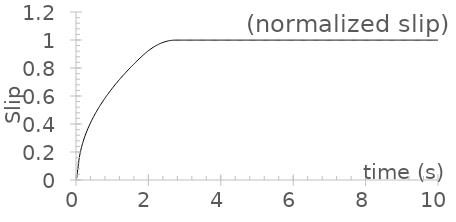
| Category | displacement |
|---|---|
| 0.0 | 0 |
| 0.01 | 0.004 |
| 0.02 | 0.015 |
| 0.03 | 0.032 |
| 0.04 | 0.053 |
| 0.05 | 0.076 |
| 0.06 | 0.099 |
| 0.07 | 0.121 |
| 0.08 | 0.141 |
| 0.09 | 0.158 |
| 0.1 | 0.172 |
| 0.11 | 0.186 |
| 0.12 | 0.198 |
| 0.13 | 0.21 |
| 0.14 | 0.221 |
| 0.15 | 0.231 |
| 0.16 | 0.241 |
| 0.17 | 0.251 |
| 0.18 | 0.26 |
| 0.19 | 0.268 |
| 0.2 | 0.277 |
| 0.21 | 0.285 |
| 0.22 | 0.293 |
| 0.23 | 0.3 |
| 0.24 | 0.308 |
| 0.25 | 0.315 |
| 0.26 | 0.322 |
| 0.27 | 0.329 |
| 0.28 | 0.336 |
| 0.29 | 0.343 |
| 0.3 | 0.349 |
| 0.31 | 0.355 |
| 0.32 | 0.362 |
| 0.33 | 0.368 |
| 0.34 | 0.374 |
| 0.35 | 0.38 |
| 0.36 | 0.386 |
| 0.37 | 0.391 |
| 0.38 | 0.397 |
| 0.39 | 0.402 |
| 0.4 | 0.408 |
| 0.41 | 0.413 |
| 0.42 | 0.419 |
| 0.43 | 0.424 |
| 0.44 | 0.429 |
| 0.45 | 0.434 |
| 0.46 | 0.439 |
| 0.47 | 0.444 |
| 0.48 | 0.449 |
| 0.49 | 0.454 |
| 0.5 | 0.459 |
| 0.51 | 0.464 |
| 0.52 | 0.468 |
| 0.53 | 0.473 |
| 0.54 | 0.478 |
| 0.55 | 0.482 |
| 0.56 | 0.487 |
| 0.57 | 0.491 |
| 0.58 | 0.496 |
| 0.59 | 0.5 |
| 0.6 | 0.504 |
| 0.61 | 0.509 |
| 0.62 | 0.513 |
| 0.63 | 0.517 |
| 0.64 | 0.521 |
| 0.65 | 0.526 |
| 0.66 | 0.53 |
| 0.67 | 0.534 |
| 0.68 | 0.538 |
| 0.69 | 0.542 |
| 0.7 | 0.546 |
| 0.71 | 0.55 |
| 0.72 | 0.554 |
| 0.73 | 0.558 |
| 0.74 | 0.562 |
| 0.75 | 0.566 |
| 0.76 | 0.569 |
| 0.77 | 0.573 |
| 0.78 | 0.577 |
| 0.79 | 0.581 |
| 0.8 | 0.584 |
| 0.81 | 0.588 |
| 0.82 | 0.592 |
| 0.83 | 0.596 |
| 0.84 | 0.599 |
| 0.85 | 0.603 |
| 0.86 | 0.606 |
| 0.87 | 0.61 |
| 0.88 | 0.613 |
| 0.89 | 0.617 |
| 0.9 | 0.62 |
| 0.91 | 0.624 |
| 0.92 | 0.627 |
| 0.93 | 0.631 |
| 0.94 | 0.634 |
| 0.95 | 0.638 |
| 0.96 | 0.641 |
| 0.97 | 0.644 |
| 0.98 | 0.648 |
| 0.99 | 0.651 |
| 1.0 | 0.654 |
| 1.01 | 0.658 |
| 1.02 | 0.661 |
| 1.03 | 0.664 |
| 1.04 | 0.668 |
| 1.05 | 0.671 |
| 1.06 | 0.674 |
| 1.07 | 0.677 |
| 1.08 | 0.68 |
| 1.09 | 0.684 |
| 1.1 | 0.687 |
| 1.11 | 0.69 |
| 1.12 | 0.693 |
| 1.13 | 0.696 |
| 1.14 | 0.699 |
| 1.15 | 0.702 |
| 1.16 | 0.705 |
| 1.17 | 0.708 |
| 1.18 | 0.711 |
| 1.19 | 0.714 |
| 1.2 | 0.717 |
| 1.21 | 0.72 |
| 1.22 | 0.723 |
| 1.23 | 0.726 |
| 1.24 | 0.729 |
| 1.25 | 0.732 |
| 1.26 | 0.735 |
| 1.27 | 0.738 |
| 1.28 | 0.741 |
| 1.29 | 0.744 |
| 1.3 | 0.747 |
| 1.31 | 0.75 |
| 1.32 | 0.753 |
| 1.33 | 0.755 |
| 1.34 | 0.758 |
| 1.35 | 0.761 |
| 1.36 | 0.764 |
| 1.37 | 0.767 |
| 1.38 | 0.769 |
| 1.39 | 0.772 |
| 1.4 | 0.775 |
| 1.41 | 0.778 |
| 1.42 | 0.781 |
| 1.43 | 0.783 |
| 1.44 | 0.786 |
| 1.45 | 0.789 |
| 1.46 | 0.791 |
| 1.47 | 0.794 |
| 1.48 | 0.797 |
| 1.49 | 0.8 |
| 1.5 | 0.802 |
| 1.51 | 0.805 |
| 1.52 | 0.808 |
| 1.53 | 0.81 |
| 1.54 | 0.813 |
| 1.55 | 0.816 |
| 1.56 | 0.818 |
| 1.57 | 0.821 |
| 1.58 | 0.823 |
| 1.59 | 0.826 |
| 1.6 | 0.829 |
| 1.61 | 0.831 |
| 1.62 | 0.834 |
| 1.63 | 0.836 |
| 1.64 | 0.839 |
| 1.65 | 0.841 |
| 1.66 | 0.844 |
| 1.67 | 0.846 |
| 1.68 | 0.849 |
| 1.69 | 0.852 |
| 1.7 | 0.854 |
| 1.71 | 0.857 |
| 1.72 | 0.859 |
| 1.73 | 0.862 |
| 1.74 | 0.864 |
| 1.75 | 0.866 |
| 1.76 | 0.869 |
| 1.77 | 0.871 |
| 1.78 | 0.874 |
| 1.79 | 0.876 |
| 1.8 | 0.879 |
| 1.81 | 0.881 |
| 1.82 | 0.884 |
| 1.83 | 0.886 |
| 1.84 | 0.888 |
| 1.85 | 0.891 |
| 1.86 | 0.893 |
| 1.87 | 0.896 |
| 1.88 | 0.898 |
| 1.89 | 0.9 |
| 1.9 | 0.902 |
| 1.91 | 0.905 |
| 1.92 | 0.907 |
| 1.93 | 0.909 |
| 1.94 | 0.911 |
| 1.95 | 0.913 |
| 1.96 | 0.915 |
| 1.97 | 0.918 |
| 1.98 | 0.92 |
| 1.99 | 0.922 |
| 2.0 | 0.924 |
| 2.01 | 0.926 |
| 2.02 | 0.928 |
| 2.03 | 0.929 |
| 2.04 | 0.931 |
| 2.05 | 0.933 |
| 2.06 | 0.935 |
| 2.07 | 0.937 |
| 2.08 | 0.939 |
| 2.09 | 0.94 |
| 2.1 | 0.942 |
| 2.11 | 0.944 |
| 2.12 | 0.946 |
| 2.13 | 0.947 |
| 2.14 | 0.949 |
| 2.15 | 0.951 |
| 2.16 | 0.952 |
| 2.17 | 0.954 |
| 2.18 | 0.955 |
| 2.19 | 0.957 |
| 2.2 | 0.958 |
| 2.21 | 0.96 |
| 2.22 | 0.961 |
| 2.23 | 0.962 |
| 2.24 | 0.964 |
| 2.25 | 0.965 |
| 2.26 | 0.966 |
| 2.27 | 0.968 |
| 2.28 | 0.969 |
| 2.29 | 0.97 |
| 2.3 | 0.972 |
| 2.31 | 0.973 |
| 2.32 | 0.974 |
| 2.33 | 0.975 |
| 2.34 | 0.976 |
| 2.35 | 0.977 |
| 2.36 | 0.978 |
| 2.37 | 0.979 |
| 2.38 | 0.98 |
| 2.39 | 0.981 |
| 2.4 | 0.982 |
| 2.41 | 0.983 |
| 2.42 | 0.984 |
| 2.43 | 0.985 |
| 2.44 | 0.986 |
| 2.45 | 0.987 |
| 2.46 | 0.987 |
| 2.47 | 0.988 |
| 2.48 | 0.989 |
| 2.49 | 0.99 |
| 2.5 | 0.99 |
| 2.51 | 0.991 |
| 2.52 | 0.992 |
| 2.53 | 0.992 |
| 2.54 | 0.993 |
| 2.55 | 0.993 |
| 2.56 | 0.994 |
| 2.57 | 0.994 |
| 2.58 | 0.995 |
| 2.59 | 0.995 |
| 2.6 | 0.996 |
| 2.61 | 0.996 |
| 2.62 | 0.997 |
| 2.63 | 0.997 |
| 2.64 | 0.997 |
| 2.65 | 0.998 |
| 2.66 | 0.998 |
| 2.67 | 0.998 |
| 2.68 | 0.998 |
| 2.69 | 0.999 |
| 2.7 | 0.999 |
| 2.71 | 0.999 |
| 2.72 | 0.999 |
| 2.73 | 0.999 |
| 2.74 | 0.999 |
| 2.75 | 0.999 |
| 2.76 | 0.999 |
| 2.77 | 0.999 |
| 2.78 | 0.999 |
| 2.79 | 0.999 |
| 2.8 | 0.999 |
| 2.81 | 0.999 |
| 2.82 | 0.999 |
| 2.83 | 0.999 |
| 2.84 | 0.999 |
| 2.85 | 0.999 |
| 2.86 | 0.999 |
| 2.87 | 0.999 |
| 2.88 | 0.999 |
| 2.89 | 0.999 |
| 2.9 | 0.999 |
| 2.91 | 0.999 |
| 2.92 | 0.999 |
| 2.93 | 0.999 |
| 2.94 | 0.999 |
| 2.95 | 0.999 |
| 2.96 | 0.999 |
| 2.97 | 0.999 |
| 2.98 | 0.999 |
| 2.99 | 0.999 |
| 3.0 | 0.999 |
| 3.01 | 0.999 |
| 3.02 | 0.999 |
| 3.03 | 0.999 |
| 3.04 | 0.999 |
| 3.05 | 0.999 |
| 3.06 | 0.999 |
| 3.07 | 0.999 |
| 3.08 | 0.999 |
| 3.09 | 0.999 |
| 3.1 | 0.999 |
| 3.11 | 0.999 |
| 3.12 | 0.999 |
| 3.13 | 0.999 |
| 3.14 | 0.999 |
| 3.15 | 0.999 |
| 3.16 | 0.999 |
| 3.17 | 0.999 |
| 3.18 | 0.999 |
| 3.19 | 0.999 |
| 3.2 | 0.999 |
| 3.21 | 0.999 |
| 3.22 | 0.999 |
| 3.23 | 0.999 |
| 3.24 | 0.999 |
| 3.25 | 0.999 |
| 3.26 | 0.999 |
| 3.27 | 0.999 |
| 3.28 | 0.999 |
| 3.29 | 0.999 |
| 3.3 | 0.999 |
| 3.31 | 0.999 |
| 3.32 | 0.999 |
| 3.33 | 0.999 |
| 3.34 | 0.999 |
| 3.35 | 0.999 |
| 3.36 | 0.999 |
| 3.37 | 0.999 |
| 3.38 | 0.999 |
| 3.39 | 0.999 |
| 3.4 | 0.999 |
| 3.41 | 0.999 |
| 3.42 | 0.999 |
| 3.43 | 0.999 |
| 3.44 | 0.999 |
| 3.45 | 0.999 |
| 3.46 | 0.999 |
| 3.47 | 0.999 |
| 3.48 | 0.999 |
| 3.49 | 0.999 |
| 3.5 | 0.999 |
| 3.51 | 0.999 |
| 3.52 | 0.999 |
| 3.53 | 0.999 |
| 3.54 | 0.999 |
| 3.55 | 0.999 |
| 3.56 | 0.999 |
| 3.57 | 0.999 |
| 3.58 | 0.999 |
| 3.59 | 0.999 |
| 3.6 | 0.999 |
| 3.61 | 0.999 |
| 3.62 | 0.999 |
| 3.63 | 0.999 |
| 3.64 | 0.999 |
| 3.65 | 0.999 |
| 3.66 | 0.999 |
| 3.67 | 0.999 |
| 3.68 | 0.999 |
| 3.69 | 0.999 |
| 3.7 | 0.999 |
| 3.71 | 0.999 |
| 3.72 | 0.999 |
| 3.73 | 0.999 |
| 3.74 | 0.999 |
| 3.75 | 0.999 |
| 3.76 | 0.999 |
| 3.77 | 0.999 |
| 3.78 | 0.999 |
| 3.79 | 0.999 |
| 3.8 | 0.999 |
| 3.81 | 0.999 |
| 3.82 | 0.999 |
| 3.83 | 0.999 |
| 3.84 | 0.999 |
| 3.85 | 0.999 |
| 3.86 | 0.999 |
| 3.87 | 0.999 |
| 3.88 | 0.999 |
| 3.89 | 0.999 |
| 3.9 | 0.999 |
| 3.91 | 0.999 |
| 3.92 | 0.999 |
| 3.93 | 0.999 |
| 3.94 | 0.999 |
| 3.95 | 0.999 |
| 3.96 | 0.999 |
| 3.97 | 0.999 |
| 3.98 | 0.999 |
| 3.99 | 0.999 |
| 4.0 | 0.999 |
| 4.01 | 0.999 |
| 4.02 | 0.999 |
| 4.03 | 0.999 |
| 4.04 | 0.999 |
| 4.05 | 0.999 |
| 4.06 | 0.999 |
| 4.07 | 0.999 |
| 4.08 | 0.999 |
| 4.09 | 0.999 |
| 4.1 | 0.999 |
| 4.11 | 0.999 |
| 4.12 | 0.999 |
| 4.13 | 0.999 |
| 4.14 | 0.999 |
| 4.15 | 0.999 |
| 4.16 | 0.999 |
| 4.17 | 0.999 |
| 4.18 | 0.999 |
| 4.19 | 0.999 |
| 4.2 | 0.999 |
| 4.21 | 0.999 |
| 4.22 | 0.999 |
| 4.23 | 0.999 |
| 4.24 | 0.999 |
| 4.25 | 0.999 |
| 4.26 | 0.999 |
| 4.27 | 0.999 |
| 4.28 | 0.999 |
| 4.29 | 0.999 |
| 4.3 | 0.999 |
| 4.31 | 0.999 |
| 4.32 | 0.999 |
| 4.33 | 0.999 |
| 4.34 | 0.999 |
| 4.35 | 0.999 |
| 4.36 | 0.999 |
| 4.37 | 0.999 |
| 4.38 | 0.999 |
| 4.39 | 0.999 |
| 4.4 | 0.999 |
| 4.41 | 0.999 |
| 4.42 | 0.999 |
| 4.43 | 0.999 |
| 4.44 | 0.999 |
| 4.45 | 0.999 |
| 4.46 | 0.999 |
| 4.47 | 0.999 |
| 4.48 | 0.999 |
| 4.49 | 0.999 |
| 4.5 | 0.999 |
| 4.51 | 0.999 |
| 4.52 | 0.999 |
| 4.53 | 0.999 |
| 4.54 | 0.999 |
| 4.55 | 0.999 |
| 4.56 | 0.999 |
| 4.57 | 0.999 |
| 4.58 | 0.999 |
| 4.59 | 0.999 |
| 4.6 | 0.999 |
| 4.61 | 0.999 |
| 4.62 | 0.999 |
| 4.63 | 0.999 |
| 4.64 | 0.999 |
| 4.65 | 0.999 |
| 4.66 | 0.999 |
| 4.67 | 0.999 |
| 4.68 | 0.999 |
| 4.69 | 0.999 |
| 4.7 | 0.999 |
| 4.71 | 0.999 |
| 4.72 | 0.999 |
| 4.73 | 0.999 |
| 4.74 | 0.999 |
| 4.75 | 0.999 |
| 4.76 | 0.999 |
| 4.77 | 0.999 |
| 4.78 | 0.999 |
| 4.79 | 0.999 |
| 4.8 | 0.999 |
| 4.81 | 0.999 |
| 4.82 | 0.999 |
| 4.83 | 0.999 |
| 4.84 | 0.999 |
| 4.85 | 0.999 |
| 4.86 | 0.999 |
| 4.87 | 0.999 |
| 4.88 | 0.999 |
| 4.89 | 0.999 |
| 4.9 | 0.999 |
| 4.91 | 0.999 |
| 4.92 | 0.999 |
| 4.93 | 0.999 |
| 4.94 | 0.999 |
| 4.95 | 0.999 |
| 4.96 | 0.999 |
| 4.97 | 0.999 |
| 4.98 | 0.999 |
| 4.99 | 0.999 |
| 5.0 | 0.999 |
| 5.01 | 0.999 |
| 5.02 | 0.999 |
| 5.03 | 0.999 |
| 5.04 | 0.999 |
| 5.05 | 0.999 |
| 5.06 | 0.999 |
| 5.07 | 0.999 |
| 5.08 | 0.999 |
| 5.09 | 0.999 |
| 5.1 | 0.999 |
| 5.11 | 0.999 |
| 5.12 | 0.999 |
| 5.13 | 0.999 |
| 5.14 | 0.999 |
| 5.15 | 0.999 |
| 5.16 | 0.999 |
| 5.17 | 0.999 |
| 5.18 | 0.999 |
| 5.19 | 0.999 |
| 5.2 | 0.999 |
| 5.21 | 0.999 |
| 5.22 | 0.999 |
| 5.23 | 0.999 |
| 5.24 | 0.999 |
| 5.25 | 0.999 |
| 5.26 | 0.999 |
| 5.27 | 0.999 |
| 5.28 | 0.999 |
| 5.29 | 0.999 |
| 5.3 | 0.999 |
| 5.31 | 0.999 |
| 5.32 | 0.999 |
| 5.33 | 0.999 |
| 5.34 | 0.999 |
| 5.35 | 0.999 |
| 5.36 | 0.999 |
| 5.37 | 0.999 |
| 5.38 | 0.999 |
| 5.39 | 0.999 |
| 5.4 | 0.999 |
| 5.41 | 0.999 |
| 5.42 | 0.999 |
| 5.43 | 0.999 |
| 5.44 | 0.999 |
| 5.45 | 0.999 |
| 5.46 | 0.999 |
| 5.47 | 0.999 |
| 5.48 | 0.999 |
| 5.49 | 0.999 |
| 5.5 | 0.999 |
| 5.51 | 0.999 |
| 5.52 | 0.999 |
| 5.53 | 0.999 |
| 5.54 | 0.999 |
| 5.55 | 0.999 |
| 5.56 | 0.999 |
| 5.57 | 0.999 |
| 5.58 | 0.999 |
| 5.59 | 0.999 |
| 5.6 | 0.999 |
| 5.61 | 0.999 |
| 5.62 | 0.999 |
| 5.63 | 0.999 |
| 5.64 | 0.999 |
| 5.65 | 0.999 |
| 5.66 | 0.999 |
| 5.67 | 0.999 |
| 5.68 | 0.999 |
| 5.69 | 0.999 |
| 5.7 | 0.999 |
| 5.71 | 0.999 |
| 5.72 | 0.999 |
| 5.73 | 0.999 |
| 5.74 | 0.999 |
| 5.75 | 0.999 |
| 5.76 | 0.999 |
| 5.77 | 0.999 |
| 5.78 | 0.999 |
| 5.79 | 0.999 |
| 5.8 | 0.999 |
| 5.81 | 0.999 |
| 5.82 | 0.999 |
| 5.83 | 0.999 |
| 5.84 | 0.999 |
| 5.85 | 0.999 |
| 5.86 | 0.999 |
| 5.87 | 0.999 |
| 5.88 | 0.999 |
| 5.89 | 0.999 |
| 5.9 | 0.999 |
| 5.91 | 0.999 |
| 5.92 | 0.999 |
| 5.93 | 0.999 |
| 5.94 | 0.999 |
| 5.95 | 0.999 |
| 5.96 | 0.999 |
| 5.97 | 0.999 |
| 5.98 | 0.999 |
| 5.99 | 0.999 |
| 6.0 | 0.999 |
| 6.01 | 0.999 |
| 6.02 | 0.999 |
| 6.03 | 0.999 |
| 6.04 | 0.999 |
| 6.05 | 0.999 |
| 6.06 | 0.999 |
| 6.07 | 0.999 |
| 6.08 | 0.999 |
| 6.09 | 0.999 |
| 6.1 | 0.999 |
| 6.11 | 0.999 |
| 6.12 | 0.999 |
| 6.13 | 0.999 |
| 6.14 | 0.999 |
| 6.15 | 0.999 |
| 6.16 | 0.999 |
| 6.17 | 0.999 |
| 6.18 | 0.999 |
| 6.19 | 0.999 |
| 6.2 | 0.999 |
| 6.21 | 0.999 |
| 6.22 | 0.999 |
| 6.23 | 0.999 |
| 6.24 | 0.999 |
| 6.25 | 0.999 |
| 6.26 | 0.999 |
| 6.27 | 0.999 |
| 6.28 | 0.999 |
| 6.29 | 0.999 |
| 6.3 | 0.999 |
| 6.31 | 0.999 |
| 6.32 | 0.999 |
| 6.33 | 0.999 |
| 6.34 | 0.999 |
| 6.35 | 0.999 |
| 6.36 | 0.999 |
| 6.37 | 0.999 |
| 6.38 | 0.999 |
| 6.39 | 0.999 |
| 6.4 | 0.999 |
| 6.41 | 0.999 |
| 6.42 | 0.999 |
| 6.43 | 0.999 |
| 6.44 | 0.999 |
| 6.45 | 0.999 |
| 6.46 | 0.999 |
| 6.47 | 0.999 |
| 6.48 | 0.999 |
| 6.49 | 0.999 |
| 6.5 | 0.999 |
| 6.51 | 0.999 |
| 6.52 | 0.999 |
| 6.53 | 0.999 |
| 6.54 | 0.999 |
| 6.55 | 0.999 |
| 6.56 | 0.999 |
| 6.57 | 0.999 |
| 6.58 | 0.999 |
| 6.59 | 0.999 |
| 6.6 | 0.999 |
| 6.61 | 0.999 |
| 6.62 | 0.999 |
| 6.63 | 0.999 |
| 6.64 | 0.999 |
| 6.65 | 0.999 |
| 6.66 | 0.999 |
| 6.67 | 0.999 |
| 6.68 | 0.999 |
| 6.69 | 0.999 |
| 6.7 | 0.999 |
| 6.71 | 0.999 |
| 6.72 | 0.999 |
| 6.73 | 0.999 |
| 6.74 | 0.999 |
| 6.75 | 0.999 |
| 6.76 | 0.999 |
| 6.77 | 0.999 |
| 6.78 | 0.999 |
| 6.79 | 0.999 |
| 6.8 | 0.999 |
| 6.81 | 0.999 |
| 6.82 | 0.999 |
| 6.83 | 0.999 |
| 6.84 | 0.999 |
| 6.85 | 0.999 |
| 6.86 | 0.999 |
| 6.87 | 0.999 |
| 6.88 | 0.999 |
| 6.89 | 0.999 |
| 6.9 | 0.999 |
| 6.91 | 0.999 |
| 6.92 | 0.999 |
| 6.93 | 0.999 |
| 6.94 | 0.999 |
| 6.95 | 0.999 |
| 6.96 | 0.999 |
| 6.97 | 0.999 |
| 6.98 | 0.999 |
| 6.99 | 0.999 |
| 7.0 | 0.999 |
| 7.01 | 0.999 |
| 7.02 | 0.999 |
| 7.03 | 0.999 |
| 7.04 | 0.999 |
| 7.05 | 0.999 |
| 7.06 | 0.999 |
| 7.07 | 0.999 |
| 7.08 | 0.999 |
| 7.09 | 0.999 |
| 7.1 | 0.999 |
| 7.11 | 0.999 |
| 7.12 | 0.999 |
| 7.13 | 0.999 |
| 7.14 | 0.999 |
| 7.15 | 0.999 |
| 7.16 | 0.999 |
| 7.17 | 0.999 |
| 7.18 | 0.999 |
| 7.19 | 0.999 |
| 7.2 | 0.999 |
| 7.21 | 0.999 |
| 7.22 | 0.999 |
| 7.23 | 0.999 |
| 7.24 | 0.999 |
| 7.25 | 0.999 |
| 7.26 | 0.999 |
| 7.27 | 0.999 |
| 7.28 | 0.999 |
| 7.29 | 0.999 |
| 7.3 | 0.999 |
| 7.31 | 0.999 |
| 7.32 | 0.999 |
| 7.33 | 0.999 |
| 7.34 | 0.999 |
| 7.35 | 0.999 |
| 7.36 | 0.999 |
| 7.37 | 0.999 |
| 7.38 | 0.999 |
| 7.39 | 0.999 |
| 7.4 | 0.999 |
| 7.41 | 0.999 |
| 7.42 | 0.999 |
| 7.43 | 0.999 |
| 7.44 | 0.999 |
| 7.45 | 0.999 |
| 7.46 | 0.999 |
| 7.47 | 0.999 |
| 7.48 | 0.999 |
| 7.49 | 0.999 |
| 7.5 | 0.999 |
| 7.51 | 0.999 |
| 7.52 | 0.999 |
| 7.53 | 0.999 |
| 7.54 | 0.999 |
| 7.55 | 0.999 |
| 7.56 | 0.999 |
| 7.57 | 0.999 |
| 7.58 | 0.999 |
| 7.59 | 0.999 |
| 7.6 | 0.999 |
| 7.61 | 0.999 |
| 7.62 | 0.999 |
| 7.63 | 0.999 |
| 7.64 | 0.999 |
| 7.65 | 0.999 |
| 7.66 | 0.999 |
| 7.67 | 0.999 |
| 7.68 | 0.999 |
| 7.69 | 0.999 |
| 7.7 | 0.999 |
| 7.71 | 0.999 |
| 7.72 | 0.999 |
| 7.73 | 0.999 |
| 7.74 | 0.999 |
| 7.75 | 0.999 |
| 7.76 | 0.999 |
| 7.77 | 0.999 |
| 7.78 | 0.999 |
| 7.79 | 0.999 |
| 7.8 | 0.999 |
| 7.81 | 0.999 |
| 7.82 | 0.999 |
| 7.83 | 0.999 |
| 7.84 | 0.999 |
| 7.85 | 0.999 |
| 7.86 | 0.999 |
| 7.87 | 0.999 |
| 7.88 | 0.999 |
| 7.89 | 0.999 |
| 7.9 | 0.999 |
| 7.91 | 0.999 |
| 7.92 | 0.999 |
| 7.93 | 0.999 |
| 7.94 | 0.999 |
| 7.95 | 0.999 |
| 7.96 | 0.999 |
| 7.97 | 0.999 |
| 7.98 | 0.999 |
| 7.99 | 0.999 |
| 8.0 | 0.999 |
| 8.01 | 0.999 |
| 8.02 | 0.999 |
| 8.03 | 0.999 |
| 8.04 | 0.999 |
| 8.05 | 0.999 |
| 8.06 | 0.999 |
| 8.07 | 0.999 |
| 8.08 | 0.999 |
| 8.09 | 0.999 |
| 8.1 | 0.999 |
| 8.11 | 0.999 |
| 8.12 | 0.999 |
| 8.13 | 0.999 |
| 8.14 | 0.999 |
| 8.15 | 0.999 |
| 8.16 | 0.999 |
| 8.17 | 0.999 |
| 8.18 | 0.999 |
| 8.19 | 0.999 |
| 8.2 | 0.999 |
| 8.21 | 0.999 |
| 8.22 | 0.999 |
| 8.23 | 0.999 |
| 8.24 | 0.999 |
| 8.25 | 0.999 |
| 8.26 | 0.999 |
| 8.27 | 0.999 |
| 8.28 | 0.999 |
| 8.29 | 0.999 |
| 8.3 | 0.999 |
| 8.31 | 0.999 |
| 8.32 | 0.999 |
| 8.33 | 0.999 |
| 8.34 | 0.999 |
| 8.35 | 0.999 |
| 8.36 | 0.999 |
| 8.37 | 0.999 |
| 8.38 | 0.999 |
| 8.39 | 0.999 |
| 8.4 | 0.999 |
| 8.41 | 0.999 |
| 8.42 | 0.999 |
| 8.43 | 0.999 |
| 8.44 | 0.999 |
| 8.45 | 0.999 |
| 8.46 | 0.999 |
| 8.47 | 0.999 |
| 8.48 | 0.999 |
| 8.49 | 0.999 |
| 8.5 | 0.999 |
| 8.51 | 0.999 |
| 8.52 | 0.999 |
| 8.53 | 0.999 |
| 8.54 | 0.999 |
| 8.55 | 0.999 |
| 8.56 | 0.999 |
| 8.57 | 0.999 |
| 8.58 | 0.999 |
| 8.59 | 0.999 |
| 8.6 | 0.999 |
| 8.61 | 0.999 |
| 8.62 | 0.999 |
| 8.63 | 0.999 |
| 8.64 | 0.999 |
| 8.65 | 0.999 |
| 8.66 | 0.999 |
| 8.67 | 0.999 |
| 8.68 | 0.999 |
| 8.69 | 0.999 |
| 8.7 | 0.999 |
| 8.71 | 0.999 |
| 8.72 | 0.999 |
| 8.73 | 0.999 |
| 8.74 | 0.999 |
| 8.75 | 0.999 |
| 8.76 | 0.999 |
| 8.77 | 0.999 |
| 8.78 | 0.999 |
| 8.79 | 0.999 |
| 8.8 | 0.999 |
| 8.81 | 0.999 |
| 8.82 | 0.999 |
| 8.83 | 0.999 |
| 8.84 | 0.999 |
| 8.85 | 0.999 |
| 8.86 | 0.999 |
| 8.87 | 0.999 |
| 8.88 | 0.999 |
| 8.89 | 0.999 |
| 8.9 | 0.999 |
| 8.91 | 0.999 |
| 8.92 | 0.999 |
| 8.93 | 0.999 |
| 8.94 | 0.999 |
| 8.95 | 0.999 |
| 8.96 | 0.999 |
| 8.97 | 0.999 |
| 8.98 | 0.999 |
| 8.99 | 0.999 |
| 9.0 | 0.999 |
| 9.01 | 0.999 |
| 9.02 | 0.999 |
| 9.03 | 0.999 |
| 9.04 | 0.999 |
| 9.05 | 0.999 |
| 9.06 | 0.999 |
| 9.07 | 0.999 |
| 9.08 | 0.999 |
| 9.09 | 0.999 |
| 9.1 | 0.999 |
| 9.11 | 0.999 |
| 9.12 | 0.999 |
| 9.13 | 0.999 |
| 9.14 | 0.999 |
| 9.15 | 0.999 |
| 9.16 | 0.999 |
| 9.17 | 0.999 |
| 9.18 | 0.999 |
| 9.19 | 0.999 |
| 9.2 | 0.999 |
| 9.21 | 0.999 |
| 9.22 | 0.999 |
| 9.23 | 0.999 |
| 9.24 | 0.999 |
| 9.25 | 0.999 |
| 9.26 | 0.999 |
| 9.27 | 0.999 |
| 9.28 | 0.999 |
| 9.29 | 0.999 |
| 9.3 | 0.999 |
| 9.31 | 0.999 |
| 9.32 | 0.999 |
| 9.33 | 0.999 |
| 9.34 | 0.999 |
| 9.35 | 0.999 |
| 9.36 | 0.999 |
| 9.37 | 0.999 |
| 9.38 | 0.999 |
| 9.39 | 0.999 |
| 9.4 | 0.999 |
| 9.41 | 0.999 |
| 9.42 | 0.999 |
| 9.43 | 0.999 |
| 9.44 | 0.999 |
| 9.45 | 0.999 |
| 9.46 | 0.999 |
| 9.47 | 0.999 |
| 9.48 | 0.999 |
| 9.49 | 0.999 |
| 9.5 | 0.999 |
| 9.51 | 0.999 |
| 9.52 | 0.999 |
| 9.53 | 0.999 |
| 9.54 | 0.999 |
| 9.55 | 0.999 |
| 9.56 | 0.999 |
| 9.57 | 0.999 |
| 9.58 | 0.999 |
| 9.59 | 0.999 |
| 9.6 | 0.999 |
| 9.61 | 0.999 |
| 9.62 | 0.999 |
| 9.63 | 0.999 |
| 9.64 | 0.999 |
| 9.65 | 0.999 |
| 9.66 | 0.999 |
| 9.67 | 0.999 |
| 9.68 | 0.999 |
| 9.69 | 0.999 |
| 9.7 | 0.999 |
| 9.71 | 0.999 |
| 9.72 | 0.999 |
| 9.73 | 0.999 |
| 9.74 | 0.999 |
| 9.75 | 0.999 |
| 9.76 | 0.999 |
| 9.77 | 0.999 |
| 9.78 | 0.999 |
| 9.79 | 0.999 |
| 9.8 | 0.999 |
| 9.81 | 0.999 |
| 9.82 | 0.999 |
| 9.83 | 0.999 |
| 9.84 | 0.999 |
| 9.85 | 0.999 |
| 9.86 | 0.999 |
| 9.87 | 0.999 |
| 9.88 | 0.999 |
| 9.89 | 0.999 |
| 9.9 | 0.999 |
| 9.91 | 0.999 |
| 9.92 | 0.999 |
| 9.93 | 0.999 |
| 9.94 | 0.999 |
| 9.95 | 0.999 |
| 9.96 | 0.999 |
| 9.97 | 0.999 |
| 9.98 | 0.999 |
| 9.99 | 0.999 |
| 10.0 | 0.999 |
| 10.01 | 0.999 |
| 10.02 | 0.999 |
| 10.03 | 0.999 |
| 10.04 | 0.999 |
| 10.05 | 0.999 |
| 10.06 | 0.999 |
| 10.07 | 0.999 |
| 10.08 | 0.999 |
| 10.09 | 0.999 |
| 10.1 | 0.999 |
| 10.11 | 0.999 |
| 10.12 | 0.999 |
| 10.13 | 0.999 |
| 10.14 | 0.999 |
| 10.15 | 0.999 |
| 10.16 | 0.999 |
| 10.17 | 0.999 |
| 10.18 | 0.999 |
| 10.19 | 0.999 |
| 10.2 | 0.999 |
| 10.21 | 0.999 |
| 10.22 | 0.999 |
| 10.23 | 0.999 |
| 10.24 | 0.999 |
| 10.25 | 0.999 |
| 10.26 | 0.999 |
| 10.27 | 0.999 |
| 10.28 | 0.999 |
| 10.29 | 0.999 |
| 10.3 | 0.999 |
| 10.31 | 0.999 |
| 10.32 | 0.999 |
| 10.33 | 0.999 |
| 10.34 | 0.999 |
| 10.35 | 0.999 |
| 10.36 | 0.999 |
| 10.37 | 0.999 |
| 10.38 | 0.999 |
| 10.39 | 0.999 |
| 10.4 | 0.999 |
| 10.41 | 0.999 |
| 10.42 | 0.999 |
| 10.43 | 0.999 |
| 10.44 | 0.999 |
| 10.45 | 0.999 |
| 10.46 | 0.999 |
| 10.47 | 0.999 |
| 10.48 | 0.999 |
| 10.49 | 0.999 |
| 10.5 | 0.999 |
| 10.51 | 0.999 |
| 10.52 | 0.999 |
| 10.53 | 0.999 |
| 10.54 | 0.999 |
| 10.55 | 0.999 |
| 10.56 | 0.999 |
| 10.57 | 0.999 |
| 10.58 | 0.999 |
| 10.59 | 0.999 |
| 10.6 | 0.999 |
| 10.61 | 0.999 |
| 10.62 | 0.999 |
| 10.63 | 0.999 |
| 10.64 | 0.999 |
| 10.65 | 0.999 |
| 10.66 | 0.999 |
| 10.67 | 0.999 |
| 10.68 | 0.999 |
| 10.69 | 0.999 |
| 10.7 | 0.999 |
| 10.71 | 0.999 |
| 10.72 | 0.999 |
| 10.73 | 0.999 |
| 10.74 | 0.999 |
| 10.75 | 0.999 |
| 10.76 | 0.999 |
| 10.77 | 0.999 |
| 10.78 | 0.999 |
| 10.79 | 0.999 |
| 10.8 | 0.999 |
| 10.81 | 0.999 |
| 10.82 | 0.999 |
| 10.83 | 0.999 |
| 10.84 | 0.999 |
| 10.85 | 0.999 |
| 10.86 | 0.999 |
| 10.87 | 0.999 |
| 10.88 | 0.999 |
| 10.89 | 0.999 |
| 10.9 | 0.999 |
| 10.91 | 0.999 |
| 10.92 | 0.999 |
| 10.93 | 0.999 |
| 10.94 | 0.999 |
| 10.95 | 0.999 |
| 10.96 | 0.999 |
| 10.97 | 0.999 |
| 10.98 | 0.999 |
| 10.99 | 0.999 |
| 11.0 | 0.999 |
| 11.01 | 0.999 |
| 11.02 | 0.999 |
| 11.03 | 0.999 |
| 11.04 | 0.999 |
| 11.05 | 0.999 |
| 11.06 | 0.999 |
| 11.07 | 0.999 |
| 11.08 | 0.999 |
| 11.09 | 0.999 |
| 11.1 | 0.999 |
| 11.11 | 0.999 |
| 11.12 | 0.999 |
| 11.13 | 0.999 |
| 11.14 | 0.999 |
| 11.15 | 0.999 |
| 11.16 | 0.999 |
| 11.17 | 0.999 |
| 11.18 | 0.999 |
| 11.19 | 0.999 |
| 11.2 | 0.999 |
| 11.21 | 0.999 |
| 11.22 | 0.999 |
| 11.23 | 0.999 |
| 11.24 | 0.999 |
| 11.25 | 0.999 |
| 11.26 | 0.999 |
| 11.27 | 0.999 |
| 11.28 | 0.999 |
| 11.29 | 0.999 |
| 11.3 | 0.999 |
| 11.31 | 0.999 |
| 11.32 | 0.999 |
| 11.33 | 0.999 |
| 11.34 | 0.999 |
| 11.35 | 0.999 |
| 11.36 | 0.999 |
| 11.37 | 0.999 |
| 11.38 | 0.999 |
| 11.39 | 0.999 |
| 11.4 | 0.999 |
| 11.41 | 0.999 |
| 11.42 | 0.999 |
| 11.43 | 0.999 |
| 11.44 | 0.999 |
| 11.45 | 0.999 |
| 11.46 | 0.999 |
| 11.47 | 0.999 |
| 11.48 | 0.999 |
| 11.49 | 0.999 |
| 11.5 | 0.999 |
| 11.51 | 0.999 |
| 11.52 | 0.999 |
| 11.53 | 0.999 |
| 11.54 | 0.999 |
| 11.55 | 0.999 |
| 11.56 | 0.999 |
| 11.57 | 0.999 |
| 11.58 | 0.999 |
| 11.59 | 0.999 |
| 11.6 | 0.999 |
| 11.61 | 0.999 |
| 11.62 | 0.999 |
| 11.63 | 0.999 |
| 11.64 | 0.999 |
| 11.65 | 0.999 |
| 11.66 | 0.999 |
| 11.67 | 0.999 |
| 11.68 | 0.999 |
| 11.69 | 0.999 |
| 11.7 | 0.999 |
| 11.71 | 0.999 |
| 11.72 | 0.999 |
| 11.73 | 0.999 |
| 11.74 | 0.999 |
| 11.75 | 0.999 |
| 11.76 | 0.999 |
| 11.77 | 0.999 |
| 11.78 | 0.999 |
| 11.79 | 0.999 |
| 11.8 | 0.999 |
| 11.81 | 0.999 |
| 11.82 | 0.999 |
| 11.83 | 0.999 |
| 11.84 | 0.999 |
| 11.85 | 0.999 |
| 11.86 | 0.999 |
| 11.87 | 0.999 |
| 11.88 | 0.999 |
| 11.89 | 0.999 |
| 11.9 | 0.999 |
| 11.91 | 0.999 |
| 11.92 | 0.999 |
| 11.93 | 0.999 |
| 11.94 | 0.999 |
| 11.95 | 0.999 |
| 11.96 | 0.999 |
| 11.97 | 0.999 |
| 11.98 | 0.999 |
| 11.99 | 0.999 |
| 12.0 | 0.999 |
| 12.01 | 0.999 |
| 12.02 | 0.999 |
| 12.03 | 0.999 |
| 12.04 | 0.999 |
| 12.05 | 0.999 |
| 12.06 | 0.999 |
| 12.07 | 0.999 |
| 12.08 | 0.999 |
| 12.09 | 0.999 |
| 12.1 | 0.999 |
| 12.11 | 0.999 |
| 12.12 | 0.999 |
| 12.13 | 0.999 |
| 12.14 | 0.999 |
| 12.15 | 0.999 |
| 12.16 | 0.999 |
| 12.17 | 0.999 |
| 12.18 | 0.999 |
| 12.19 | 0.999 |
| 12.2 | 0.999 |
| 12.21 | 0.999 |
| 12.22 | 0.999 |
| 12.23 | 0.999 |
| 12.24 | 0.999 |
| 12.25 | 0.999 |
| 12.26 | 0.999 |
| 12.27 | 0.999 |
| 12.28 | 0.999 |
| 12.29 | 0.999 |
| 12.3 | 0.999 |
| 12.31 | 0.999 |
| 12.32 | 0.999 |
| 12.33 | 0.999 |
| 12.34 | 0.999 |
| 12.35 | 0.999 |
| 12.36 | 0.999 |
| 12.37 | 0.999 |
| 12.38 | 0.999 |
| 12.39 | 0.999 |
| 12.4 | 0.999 |
| 12.41 | 0.999 |
| 12.42 | 0.999 |
| 12.43 | 0.999 |
| 12.44 | 0.999 |
| 12.45 | 0.999 |
| 12.46 | 0.999 |
| 12.47 | 0.999 |
| 12.48 | 0.999 |
| 12.49 | 0.999 |
| 12.5 | 0.999 |
| 12.51 | 0.999 |
| 12.52 | 0.999 |
| 12.53 | 0.999 |
| 12.54 | 0.999 |
| 12.55 | 0.999 |
| 12.56 | 0.999 |
| 12.57 | 0.999 |
| 12.58 | 0.999 |
| 12.59 | 0.999 |
| 12.6 | 0.999 |
| 12.61 | 0.999 |
| 12.62 | 0.999 |
| 12.63 | 0.999 |
| 12.64 | 0.999 |
| 12.65 | 0.999 |
| 12.66 | 0.999 |
| 12.67 | 0.999 |
| 12.68 | 0.999 |
| 12.69 | 0.999 |
| 12.7 | 0.999 |
| 12.71 | 0.999 |
| 12.72 | 0.999 |
| 12.73 | 0.999 |
| 12.74 | 0.999 |
| 12.75 | 0.999 |
| 12.76 | 0.999 |
| 12.77 | 0.999 |
| 12.78 | 0.999 |
| 12.79 | 0.999 |
| 12.8 | 0.999 |
| 12.81 | 0.999 |
| 12.82 | 0.999 |
| 12.83 | 0.999 |
| 12.84 | 0.999 |
| 12.85 | 0.999 |
| 12.86 | 0.999 |
| 12.87 | 0.999 |
| 12.88 | 0.999 |
| 12.89 | 0.999 |
| 12.9 | 0.999 |
| 12.91 | 0.999 |
| 12.92 | 0.999 |
| 12.93 | 0.999 |
| 12.94 | 0.999 |
| 12.95 | 0.999 |
| 12.96 | 0.999 |
| 12.97 | 0.999 |
| 12.98 | 0.999 |
| 12.99 | 0.999 |
| 13.0 | 0.999 |
| 13.01 | 0.999 |
| 13.02 | 0.999 |
| 13.03 | 0.999 |
| 13.04 | 0.999 |
| 13.05 | 0.999 |
| 13.06 | 0.999 |
| 13.07 | 0.999 |
| 13.08 | 0.999 |
| 13.09 | 0.999 |
| 13.1 | 0.999 |
| 13.11 | 0.999 |
| 13.12 | 0.999 |
| 13.13 | 0.999 |
| 13.14 | 0.999 |
| 13.15 | 0.999 |
| 13.16 | 0.999 |
| 13.17 | 0.999 |
| 13.18 | 0.999 |
| 13.19 | 0.999 |
| 13.2 | 0.999 |
| 13.21 | 0.999 |
| 13.22 | 0.999 |
| 13.23 | 0.999 |
| 13.24 | 0.999 |
| 13.25 | 0.999 |
| 13.26 | 0.999 |
| 13.27 | 0.999 |
| 13.28 | 0.999 |
| 13.29 | 0.999 |
| 13.3 | 0.999 |
| 13.31 | 0.999 |
| 13.32 | 0.999 |
| 13.33 | 0.999 |
| 13.34 | 0.999 |
| 13.35 | 0.999 |
| 13.36 | 0.999 |
| 13.37 | 0.999 |
| 13.38 | 0.999 |
| 13.39 | 0.999 |
| 13.4 | 0.999 |
| 13.41 | 0.999 |
| 13.42 | 0.999 |
| 13.43 | 0.999 |
| 13.44 | 0.999 |
| 13.45 | 0.999 |
| 13.46 | 0.999 |
| 13.47 | 0.999 |
| 13.48 | 0.999 |
| 13.49 | 0.999 |
| 13.5 | 0.999 |
| 13.51 | 0.999 |
| 13.52 | 0.999 |
| 13.53 | 0.999 |
| 13.54 | 0.999 |
| 13.55 | 0.999 |
| 13.56 | 0.999 |
| 13.57 | 0.999 |
| 13.58 | 0.999 |
| 13.59 | 0.999 |
| 13.6 | 0.999 |
| 13.61 | 0.999 |
| 13.62 | 0.999 |
| 13.63 | 0.999 |
| 13.64 | 0.999 |
| 13.65 | 0.999 |
| 13.66 | 0.999 |
| 13.67 | 0.999 |
| 13.68 | 0.999 |
| 13.69 | 0.999 |
| 13.7 | 0.999 |
| 13.71 | 0.999 |
| 13.72 | 0.999 |
| 13.73 | 0.999 |
| 13.74 | 0.999 |
| 13.75 | 0.999 |
| 13.76 | 0.999 |
| 13.77 | 0.999 |
| 13.78 | 0.999 |
| 13.79 | 0.999 |
| 13.8 | 0.999 |
| 13.81 | 0.999 |
| 13.82 | 0.999 |
| 13.83 | 0.999 |
| 13.84 | 0.999 |
| 13.85 | 0.999 |
| 13.86 | 0.999 |
| 13.87 | 0.999 |
| 13.88 | 0.999 |
| 13.89 | 0.999 |
| 13.9 | 0.999 |
| 13.91 | 0.999 |
| 13.92 | 0.999 |
| 13.93 | 0.999 |
| 13.94 | 0.999 |
| 13.95 | 0.999 |
| 13.96 | 0.999 |
| 13.97 | 0.999 |
| 13.98 | 0.999 |
| 13.99 | 0.999 |
| 14.0 | 0.999 |
| 14.01 | 0.999 |
| 14.02 | 0.999 |
| 14.03 | 0.999 |
| 14.04 | 0.999 |
| 14.05 | 0.999 |
| 14.06 | 0.999 |
| 14.07 | 0.999 |
| 14.08 | 0.999 |
| 14.09 | 0.999 |
| 14.1 | 0.999 |
| 14.11 | 0.999 |
| 14.12 | 0.999 |
| 14.13 | 0.999 |
| 14.14 | 0.999 |
| 14.15 | 0.999 |
| 14.16 | 0.999 |
| 14.17 | 0.999 |
| 14.18 | 0.999 |
| 14.19 | 0.999 |
| 14.2 | 0.999 |
| 14.21 | 0.999 |
| 14.22 | 0.999 |
| 14.23 | 0.999 |
| 14.24 | 0.999 |
| 14.25 | 0.999 |
| 14.26 | 0.999 |
| 14.27 | 0.999 |
| 14.28 | 0.999 |
| 14.29 | 0.999 |
| 14.3 | 0.999 |
| 14.31 | 0.999 |
| 14.32 | 0.999 |
| 14.33 | 0.999 |
| 14.34 | 0.999 |
| 14.35 | 0.999 |
| 14.36 | 0.999 |
| 14.37 | 0.999 |
| 14.38 | 0.999 |
| 14.39 | 0.999 |
| 14.4 | 0.999 |
| 14.41 | 0.999 |
| 14.42 | 0.999 |
| 14.43 | 0.999 |
| 14.44 | 0.999 |
| 14.45 | 0.999 |
| 14.46 | 0.999 |
| 14.47 | 0.999 |
| 14.48 | 0.999 |
| 14.49 | 0.999 |
| 14.5 | 0.999 |
| 14.51 | 0.999 |
| 14.52 | 0.999 |
| 14.53 | 0.999 |
| 14.54 | 0.999 |
| 14.55 | 0.999 |
| 14.56 | 0.999 |
| 14.57 | 0.999 |
| 14.58 | 0.999 |
| 14.59 | 0.999 |
| 14.6 | 0.999 |
| 14.61 | 0.999 |
| 14.62 | 0.999 |
| 14.63 | 0.999 |
| 14.64 | 0.999 |
| 14.65 | 0.999 |
| 14.66 | 0.999 |
| 14.67 | 0.999 |
| 14.68 | 0.999 |
| 14.69 | 0.999 |
| 14.7 | 0.999 |
| 14.71 | 0.999 |
| 14.72 | 0.999 |
| 14.73 | 0.999 |
| 14.74 | 0.999 |
| 14.75 | 0.999 |
| 14.76 | 0.999 |
| 14.77 | 0.999 |
| 14.78 | 0.999 |
| 14.79 | 0.999 |
| 14.8 | 0.999 |
| 14.81 | 0.999 |
| 14.82 | 0.999 |
| 14.83 | 0.999 |
| 14.84 | 0.999 |
| 14.85 | 0.999 |
| 14.86 | 0.999 |
| 14.87 | 0.999 |
| 14.88 | 0.999 |
| 14.89 | 0.999 |
| 14.9 | 0.999 |
| 14.91 | 0.999 |
| 14.92 | 0.999 |
| 14.93 | 0.999 |
| 14.94 | 0.999 |
| 14.95 | 0.999 |
| 14.96 | 0.999 |
| 14.97 | 0.999 |
| 14.98 | 0.999 |
| 14.99 | 0.999 |
| 15.0 | 0.999 |
| 15.01 | 0.999 |
| 15.02 | 0.999 |
| 15.03 | 0.999 |
| 15.04 | 0.999 |
| 15.05 | 0.999 |
| 15.06 | 0.999 |
| 15.07 | 0.999 |
| 15.08 | 0.999 |
| 15.09 | 0.999 |
| 15.1 | 0.999 |
| 15.11 | 0.999 |
| 15.12 | 0.999 |
| 15.13 | 0.999 |
| 15.14 | 0.999 |
| 15.15 | 0.999 |
| 15.16 | 0.999 |
| 15.17 | 0.999 |
| 15.18 | 0.999 |
| 15.19 | 0.999 |
| 15.2 | 0.999 |
| 15.21 | 0.999 |
| 15.22 | 0.999 |
| 15.23 | 0.999 |
| 15.24 | 0.999 |
| 15.25 | 0.999 |
| 15.26 | 0.999 |
| 15.27 | 0.999 |
| 15.28 | 0.999 |
| 15.29 | 0.999 |
| 15.3 | 0.999 |
| 15.31 | 0.999 |
| 15.32 | 0.999 |
| 15.33 | 0.999 |
| 15.34 | 0.999 |
| 15.35 | 0.999 |
| 15.36 | 0.999 |
| 15.37 | 0.999 |
| 15.38 | 0.999 |
| 15.39 | 0.999 |
| 15.4 | 0.999 |
| 15.41 | 0.999 |
| 15.42 | 0.999 |
| 15.43 | 0.999 |
| 15.44 | 0.999 |
| 15.45 | 0.999 |
| 15.46 | 0.999 |
| 15.47 | 0.999 |
| 15.48 | 0.999 |
| 15.49 | 0.999 |
| 15.5 | 0.999 |
| 15.51 | 0.999 |
| 15.52 | 0.999 |
| 15.53 | 0.999 |
| 15.54 | 0.999 |
| 15.55 | 0.999 |
| 15.56 | 0.999 |
| 15.57 | 0.999 |
| 15.58 | 0.999 |
| 15.59 | 0.999 |
| 15.6 | 0.999 |
| 15.61 | 0.999 |
| 15.62 | 0.999 |
| 15.63 | 0.999 |
| 15.64 | 0.999 |
| 15.65 | 0.999 |
| 15.66 | 0.999 |
| 15.67 | 0.999 |
| 15.68 | 0.999 |
| 15.69 | 0.999 |
| 15.7 | 0.999 |
| 15.71 | 0.999 |
| 15.72 | 0.999 |
| 15.73 | 0.999 |
| 15.74 | 0.999 |
| 15.75 | 0.999 |
| 15.76 | 0.999 |
| 15.77 | 0.999 |
| 15.78 | 0.999 |
| 15.79 | 0.999 |
| 15.8 | 0.999 |
| 15.81 | 0.999 |
| 15.82 | 0.999 |
| 15.83 | 0.999 |
| 15.84 | 0.999 |
| 15.85 | 0.999 |
| 15.86 | 0.999 |
| 15.87 | 0.999 |
| 15.88 | 0.999 |
| 15.89 | 0.999 |
| 15.9 | 0.999 |
| 15.91 | 0.999 |
| 15.92 | 0.999 |
| 15.93 | 0.999 |
| 15.94 | 0.999 |
| 15.95 | 0.999 |
| 15.96 | 0.999 |
| 15.97 | 0.999 |
| 15.98 | 0.999 |
| 15.99 | 0.999 |
| 16.0 | 0.999 |
| 16.01 | 0.999 |
| 16.02 | 0.999 |
| 16.03 | 0.999 |
| 16.04 | 0.999 |
| 16.05 | 0.999 |
| 16.06 | 0.999 |
| 16.07 | 0.999 |
| 16.08 | 0.999 |
| 16.09 | 0.999 |
| 16.1 | 0.999 |
| 16.11 | 0.999 |
| 16.12 | 0.999 |
| 16.13 | 0.999 |
| 16.14 | 0.999 |
| 16.15 | 0.999 |
| 16.16 | 0.999 |
| 16.17 | 0.999 |
| 16.18 | 0.999 |
| 16.19 | 0.999 |
| 16.2 | 0.999 |
| 16.21 | 0.999 |
| 16.22 | 0.999 |
| 16.23 | 0.999 |
| 16.24 | 0.999 |
| 16.25 | 0.999 |
| 16.26 | 0.999 |
| 16.27 | 0.999 |
| 16.28 | 0.999 |
| 16.29 | 0.999 |
| 16.3 | 0.999 |
| 16.31 | 0.999 |
| 16.32 | 0.999 |
| 16.33 | 0.999 |
| 16.34 | 0.999 |
| 16.35 | 0.999 |
| 16.36 | 0.999 |
| 16.37 | 0.999 |
| 16.38 | 0.999 |
| 16.39 | 0.999 |
| 16.4 | 0.999 |
| 16.41 | 0.999 |
| 16.42 | 0.999 |
| 16.43 | 0.999 |
| 16.44 | 0.999 |
| 16.45 | 0.999 |
| 16.46 | 0.999 |
| 16.47 | 0.999 |
| 16.48 | 0.999 |
| 16.49 | 0.999 |
| 16.5 | 0.999 |
| 16.51 | 0.999 |
| 16.52 | 0.999 |
| 16.53 | 0.999 |
| 16.54 | 0.999 |
| 16.55 | 0.999 |
| 16.56 | 0.999 |
| 16.57 | 0.999 |
| 16.58 | 0.999 |
| 16.59 | 0.999 |
| 16.6 | 0.999 |
| 16.61 | 0.999 |
| 16.62 | 0.999 |
| 16.63 | 0.999 |
| 16.64 | 0.999 |
| 16.65 | 0.999 |
| 16.66 | 0.999 |
| 16.67 | 0.999 |
| 16.68 | 0.999 |
| 16.69 | 0.999 |
| 16.7 | 0.999 |
| 16.71 | 0.999 |
| 16.72 | 0.999 |
| 16.73 | 0.999 |
| 16.74 | 0.999 |
| 16.75 | 0.999 |
| 16.76 | 0.999 |
| 16.77 | 0.999 |
| 16.78 | 0.999 |
| 16.79 | 0.999 |
| 16.8 | 0.999 |
| 16.81 | 0.999 |
| 16.82 | 0.999 |
| 16.83 | 0.999 |
| 16.84 | 0.999 |
| 16.85 | 0.999 |
| 16.86 | 0.999 |
| 16.87 | 0.999 |
| 16.88 | 0.999 |
| 16.89 | 0.999 |
| 16.9 | 0.999 |
| 16.91 | 0.999 |
| 16.92 | 0.999 |
| 16.93 | 0.999 |
| 16.94 | 0.999 |
| 16.95 | 0.999 |
| 16.96 | 0.999 |
| 16.97 | 0.999 |
| 16.98 | 0.999 |
| 16.99 | 0.999 |
| 17.0 | 0.999 |
| 17.01 | 0.999 |
| 17.02 | 0.999 |
| 17.03 | 0.999 |
| 17.04 | 0.999 |
| 17.05 | 0.999 |
| 17.06 | 0.999 |
| 17.07 | 0.999 |
| 17.08 | 0.999 |
| 17.09 | 0.999 |
| 17.1 | 0.999 |
| 17.11 | 0.999 |
| 17.12 | 0.999 |
| 17.13 | 0.999 |
| 17.14 | 0.999 |
| 17.15 | 0.999 |
| 17.16 | 0.999 |
| 17.17 | 0.999 |
| 17.18 | 0.999 |
| 17.19 | 0.999 |
| 17.2 | 0.999 |
| 17.21 | 0.999 |
| 17.22 | 0.999 |
| 17.23 | 0.999 |
| 17.24 | 0.999 |
| 17.25 | 0.999 |
| 17.26 | 0.999 |
| 17.27 | 0.999 |
| 17.28 | 0.999 |
| 17.29 | 0.999 |
| 17.3 | 0.999 |
| 17.31 | 0.999 |
| 17.32 | 0.999 |
| 17.33 | 0.999 |
| 17.34 | 0.999 |
| 17.35 | 0.999 |
| 17.36 | 0.999 |
| 17.37 | 0.999 |
| 17.38 | 0.999 |
| 17.39 | 0.999 |
| 17.4 | 0.999 |
| 17.41 | 0.999 |
| 17.42 | 0.999 |
| 17.43 | 0.999 |
| 17.44 | 0.999 |
| 17.45 | 0.999 |
| 17.46 | 0.999 |
| 17.47 | 0.999 |
| 17.48 | 0.999 |
| 17.49 | 0.999 |
| 17.5 | 0.999 |
| 17.51 | 0.999 |
| 17.52 | 0.999 |
| 17.53 | 0.999 |
| 17.54 | 0.999 |
| 17.55 | 0.999 |
| 17.56 | 0.999 |
| 17.57 | 0.999 |
| 17.58 | 0.999 |
| 17.59 | 0.999 |
| 17.6 | 0.999 |
| 17.61 | 0.999 |
| 17.62 | 0.999 |
| 17.63 | 0.999 |
| 17.64 | 0.999 |
| 17.65 | 0.999 |
| 17.66 | 0.999 |
| 17.67 | 0.999 |
| 17.68 | 0.999 |
| 17.69 | 0.999 |
| 17.7 | 0.999 |
| 17.71 | 0.999 |
| 17.72 | 0.999 |
| 17.73 | 0.999 |
| 17.74 | 0.999 |
| 17.75 | 0.999 |
| 17.76 | 0.999 |
| 17.77 | 0.999 |
| 17.78 | 0.999 |
| 17.79 | 0.999 |
| 17.8 | 0.999 |
| 17.81 | 0.999 |
| 17.82 | 0.999 |
| 17.83 | 0.999 |
| 17.84 | 0.999 |
| 17.85 | 0.999 |
| 17.86 | 0.999 |
| 17.87 | 0.999 |
| 17.88 | 0.999 |
| 17.89 | 0.999 |
| 17.9 | 0.999 |
| 17.91 | 0.999 |
| 17.92 | 0.999 |
| 17.93 | 0.999 |
| 17.94 | 0.999 |
| 17.95 | 0.999 |
| 17.96 | 0.999 |
| 17.97 | 0.999 |
| 17.98 | 0.999 |
| 17.99 | 0.999 |
| 18.0 | 0.999 |
| 18.01 | 0.999 |
| 18.02 | 0.999 |
| 18.03 | 0.999 |
| 18.04 | 0.999 |
| 18.05 | 0.999 |
| 18.06 | 0.999 |
| 18.07 | 0.999 |
| 18.08 | 0.999 |
| 18.09 | 0.999 |
| 18.1 | 0.999 |
| 18.11 | 0.999 |
| 18.12 | 0.999 |
| 18.13 | 0.999 |
| 18.14 | 0.999 |
| 18.15 | 0.999 |
| 18.16 | 0.999 |
| 18.17 | 0.999 |
| 18.18 | 0.999 |
| 18.19 | 0.999 |
| 18.2 | 0.999 |
| 18.21 | 0.999 |
| 18.22 | 0.999 |
| 18.23 | 0.999 |
| 18.24 | 0.999 |
| 18.25 | 0.999 |
| 18.26 | 0.999 |
| 18.27 | 0.999 |
| 18.28 | 0.999 |
| 18.29 | 0.999 |
| 18.3 | 0.999 |
| 18.31 | 0.999 |
| 18.32 | 0.999 |
| 18.33 | 0.999 |
| 18.34 | 0.999 |
| 18.35 | 0.999 |
| 18.36 | 0.999 |
| 18.37 | 0.999 |
| 18.38 | 0.999 |
| 18.39 | 0.999 |
| 18.4 | 0.999 |
| 18.41 | 0.999 |
| 18.42 | 0.999 |
| 18.43 | 0.999 |
| 18.44 | 0.999 |
| 18.45 | 0.999 |
| 18.46 | 0.999 |
| 18.47 | 0.999 |
| 18.48 | 0.999 |
| 18.49 | 0.999 |
| 18.5 | 0.999 |
| 18.51 | 0.999 |
| 18.52 | 0.999 |
| 18.53 | 0.999 |
| 18.54 | 0.999 |
| 18.55 | 0.999 |
| 18.56 | 0.999 |
| 18.57 | 0.999 |
| 18.58 | 0.999 |
| 18.59 | 0.999 |
| 18.6 | 0.999 |
| 18.61 | 0.999 |
| 18.62 | 0.999 |
| 18.63 | 0.999 |
| 18.64 | 0.999 |
| 18.65 | 0.999 |
| 18.66 | 0.999 |
| 18.67 | 0.999 |
| 18.68 | 0.999 |
| 18.69 | 0.999 |
| 18.7 | 0.999 |
| 18.71 | 0.999 |
| 18.72 | 0.999 |
| 18.73 | 0.999 |
| 18.74 | 0.999 |
| 18.75 | 0.999 |
| 18.76 | 0.999 |
| 18.77 | 0.999 |
| 18.78 | 0.999 |
| 18.79 | 0.999 |
| 18.8 | 0.999 |
| 18.81 | 0.999 |
| 18.82 | 0.999 |
| 18.83 | 0.999 |
| 18.84 | 0.999 |
| 18.85 | 0.999 |
| 18.86 | 0.999 |
| 18.87 | 0.999 |
| 18.88 | 0.999 |
| 18.89 | 0.999 |
| 18.9 | 0.999 |
| 18.91 | 0.999 |
| 18.92 | 0.999 |
| 18.93 | 0.999 |
| 18.94 | 0.999 |
| 18.95 | 0.999 |
| 18.96 | 0.999 |
| 18.97 | 0.999 |
| 18.98 | 0.999 |
| 18.99 | 0.999 |
| 19.0 | 0.999 |
| 19.01 | 0.999 |
| 19.02 | 0.999 |
| 19.03 | 0.999 |
| 19.04 | 0.999 |
| 19.05 | 0.999 |
| 19.06 | 0.999 |
| 19.07 | 0.999 |
| 19.08 | 0.999 |
| 19.09 | 0.999 |
| 19.1 | 0.999 |
| 19.11 | 0.999 |
| 19.12 | 0.999 |
| 19.13 | 0.999 |
| 19.14 | 0.999 |
| 19.15 | 0.999 |
| 19.16 | 0.999 |
| 19.17 | 0.999 |
| 19.18 | 0.999 |
| 19.19 | 0.999 |
| 19.2 | 0.999 |
| 19.21 | 0.999 |
| 19.22 | 0.999 |
| 19.23 | 0.999 |
| 19.24 | 0.999 |
| 19.25 | 0.999 |
| 19.26 | 0.999 |
| 19.27 | 0.999 |
| 19.28 | 0.999 |
| 19.29 | 0.999 |
| 19.3 | 0.999 |
| 19.31 | 0.999 |
| 19.32 | 0.999 |
| 19.33 | 0.999 |
| 19.34 | 0.999 |
| 19.35 | 0.999 |
| 19.36 | 0.999 |
| 19.37 | 0.999 |
| 19.38 | 0.999 |
| 19.39 | 0.999 |
| 19.4 | 0.999 |
| 19.41 | 0.999 |
| 19.42 | 0.999 |
| 19.43 | 0.999 |
| 19.44 | 0.999 |
| 19.45 | 0.999 |
| 19.46 | 0.999 |
| 19.47 | 0.999 |
| 19.48 | 0.999 |
| 19.49 | 0.999 |
| 19.5 | 0.999 |
| 19.51 | 0.999 |
| 19.52 | 0.999 |
| 19.53 | 0.999 |
| 19.54 | 0.999 |
| 19.55 | 0.999 |
| 19.56 | 0.999 |
| 19.57 | 0.999 |
| 19.58 | 0.999 |
| 19.59 | 0.999 |
| 19.6 | 0.999 |
| 19.61 | 0.999 |
| 19.62 | 0.999 |
| 19.63 | 0.999 |
| 19.64 | 0.999 |
| 19.65 | 0.999 |
| 19.66 | 0.999 |
| 19.67 | 0.999 |
| 19.68 | 0.999 |
| 19.69 | 0.999 |
| 19.7 | 0.999 |
| 19.71 | 0.999 |
| 19.72 | 0.999 |
| 19.73 | 0.999 |
| 19.74 | 0.999 |
| 19.75 | 0.999 |
| 19.76 | 0.999 |
| 19.77 | 0.999 |
| 19.78 | 0.999 |
| 19.79 | 0.999 |
| 19.8 | 0.999 |
| 19.81 | 0.999 |
| 19.82 | 0.999 |
| 19.83 | 0.999 |
| 19.84 | 0.999 |
| 19.85 | 0.999 |
| 19.86 | 0.999 |
| 19.87 | 0.999 |
| 19.88 | 0.999 |
| 19.89 | 0.999 |
| 19.9 | 0.999 |
| 19.91 | 0.999 |
| 19.92 | 0.999 |
| 19.93 | 0.999 |
| 19.94 | 0.999 |
| 19.95 | 0.999 |
| 19.96 | 0.999 |
| 19.97 | 0.999 |
| 19.98 | 0.999 |
| 19.99 | 0.999 |
| 20.0 | 0.999 |
| 20.01 | 0.999 |
| 20.02 | 0.999 |
| 20.03 | 0.999 |
| 20.04 | 0.999 |
| 20.05 | 0.999 |
| 20.06 | 0.999 |
| 20.07 | 0.999 |
| 20.08 | 0.999 |
| 20.09 | 0.999 |
| 20.1 | 0.999 |
| 20.11 | 0.999 |
| 20.12 | 0.999 |
| 20.13 | 0.999 |
| 20.14 | 0.999 |
| 20.15 | 0.999 |
| 20.16 | 0.999 |
| 20.17 | 0.999 |
| 20.18 | 0.999 |
| 20.19 | 0.999 |
| 20.2 | 0.999 |
| 20.21 | 0.999 |
| 20.22 | 0.999 |
| 20.23 | 0.999 |
| 20.24 | 0.999 |
| 20.25 | 0.999 |
| 20.26 | 0.999 |
| 20.27 | 0.999 |
| 20.28 | 0.999 |
| 20.29 | 0.999 |
| 20.3 | 0.999 |
| 20.31 | 0.999 |
| 20.32 | 0.999 |
| 20.33 | 0.999 |
| 20.34 | 0.999 |
| 20.35 | 0.999 |
| 20.36 | 0.999 |
| 20.37 | 0.999 |
| 20.38 | 0.999 |
| 20.39 | 0.999 |
| 20.4 | 0.999 |
| 20.41 | 0.999 |
| 20.42 | 0.999 |
| 20.43 | 0.999 |
| 20.44 | 0.999 |
| 20.45 | 0.999 |
| 20.46 | 0.999 |
| 20.47 | 0.999 |
| 20.48 | 0.999 |
| 20.49 | 0.999 |
| 20.5 | 0.999 |
| 20.51 | 0.999 |
| 20.52 | 0.999 |
| 20.53 | 0.999 |
| 20.54 | 0.999 |
| 20.55 | 0.999 |
| 20.56 | 0.999 |
| 20.57 | 0.999 |
| 20.58 | 0.999 |
| 20.59 | 0.999 |
| 20.6 | 0.999 |
| 20.61 | 0.999 |
| 20.62 | 0.999 |
| 20.63 | 0.999 |
| 20.64 | 0.999 |
| 20.65 | 0.999 |
| 20.66 | 0.999 |
| 20.67 | 0.999 |
| 20.68 | 0.999 |
| 20.69 | 0.999 |
| 20.7 | 0.999 |
| 20.71 | 0.999 |
| 20.72 | 0.999 |
| 20.73 | 0.999 |
| 20.74 | 0.999 |
| 20.75 | 0.999 |
| 20.76 | 0.999 |
| 20.77 | 0.999 |
| 20.78 | 0.999 |
| 20.79 | 0.999 |
| 20.8 | 0.999 |
| 20.81 | 0.999 |
| 20.82 | 0.999 |
| 20.83 | 0.999 |
| 20.84 | 0.999 |
| 20.85 | 0.999 |
| 20.86 | 0.999 |
| 20.87 | 0.999 |
| 20.88 | 0.999 |
| 20.89 | 0.999 |
| 20.9 | 0.999 |
| 20.91 | 0.999 |
| 20.92 | 0.999 |
| 20.93 | 0.999 |
| 20.94 | 0.999 |
| 20.95 | 0.999 |
| 20.96 | 0.999 |
| 20.97 | 0.999 |
| 20.98 | 0.999 |
| 20.99 | 0.999 |
| 21.0 | 0.999 |
| 21.01 | 0.999 |
| 21.02 | 0.999 |
| 21.03 | 0.999 |
| 21.04 | 0.999 |
| 21.05 | 0.999 |
| 21.06 | 0.999 |
| 21.07 | 0.999 |
| 21.08 | 0.999 |
| 21.09 | 0.999 |
| 21.1 | 0.999 |
| 21.11 | 0.999 |
| 21.12 | 0.999 |
| 21.13 | 0.999 |
| 21.14 | 0.999 |
| 21.15 | 0.999 |
| 21.16 | 0.999 |
| 21.17 | 0.999 |
| 21.18 | 0.999 |
| 21.19 | 0.999 |
| 21.2 | 0.999 |
| 21.21 | 0.999 |
| 21.22 | 0.999 |
| 21.23 | 0.999 |
| 21.24 | 0.999 |
| 21.25 | 0.999 |
| 21.26 | 0.999 |
| 21.27 | 0.999 |
| 21.28 | 0.999 |
| 21.29 | 0.999 |
| 21.3 | 0.999 |
| 21.31 | 0.999 |
| 21.32 | 0.999 |
| 21.33 | 0.999 |
| 21.34 | 0.999 |
| 21.35 | 0.999 |
| 21.36 | 0.999 |
| 21.37 | 0.999 |
| 21.38 | 0.999 |
| 21.39 | 0.999 |
| 21.4 | 0.999 |
| 21.41 | 0.999 |
| 21.42 | 0.999 |
| 21.43 | 0.999 |
| 21.44 | 0.999 |
| 21.45 | 0.999 |
| 21.46 | 0.999 |
| 21.47 | 0.999 |
| 21.48 | 0.999 |
| 21.49 | 0.999 |
| 21.5 | 0.999 |
| 21.51 | 0.999 |
| 21.52 | 0.999 |
| 21.53 | 0.999 |
| 21.54 | 0.999 |
| 21.55 | 0.999 |
| 21.56 | 0.999 |
| 21.57 | 0.999 |
| 21.58 | 0.999 |
| 21.59 | 0.999 |
| 21.6 | 0.999 |
| 21.61 | 0.999 |
| 21.62 | 0.999 |
| 21.63 | 0.999 |
| 21.64 | 0.999 |
| 21.65 | 0.999 |
| 21.66 | 0.999 |
| 21.67 | 0.999 |
| 21.68 | 0.999 |
| 21.69 | 0.999 |
| 21.7 | 0.999 |
| 21.71 | 0.999 |
| 21.72 | 0.999 |
| 21.73 | 0.999 |
| 21.74 | 0.999 |
| 21.75 | 0.999 |
| 21.76 | 0.999 |
| 21.77 | 0.999 |
| 21.78 | 0.999 |
| 21.79 | 0.999 |
| 21.8 | 0.999 |
| 21.81 | 0.999 |
| 21.82 | 0.999 |
| 21.83 | 0.999 |
| 21.84 | 0.999 |
| 21.85 | 0.999 |
| 21.86 | 0.999 |
| 21.87 | 0.999 |
| 21.88 | 0.999 |
| 21.89 | 0.999 |
| 21.9 | 0.999 |
| 21.91 | 0.999 |
| 21.92 | 0.999 |
| 21.93 | 0.999 |
| 21.94 | 0.999 |
| 21.95 | 0.999 |
| 21.96 | 0.999 |
| 21.97 | 0.999 |
| 21.98 | 0.999 |
| 21.99 | 0.999 |
| 22.0 | 0.999 |
| 22.01 | 0.999 |
| 22.02 | 0.999 |
| 22.03 | 0.999 |
| 22.04 | 0.999 |
| 22.05 | 0.999 |
| 22.06 | 0.999 |
| 22.07 | 0.999 |
| 22.08 | 0.999 |
| 22.09 | 0.999 |
| 22.1 | 0.999 |
| 22.11 | 0.999 |
| 22.12 | 0.999 |
| 22.13 | 0.999 |
| 22.14 | 0.999 |
| 22.15 | 0.999 |
| 22.16 | 0.999 |
| 22.17 | 0.999 |
| 22.18 | 0.999 |
| 22.19 | 0.999 |
| 22.2 | 0.999 |
| 22.21 | 0.999 |
| 22.22 | 0.999 |
| 22.23 | 0.999 |
| 22.24 | 0.999 |
| 22.25 | 0.999 |
| 22.26 | 0.999 |
| 22.27 | 0.999 |
| 22.28 | 0.999 |
| 22.29 | 0.999 |
| 22.3 | 0.999 |
| 22.31 | 0.999 |
| 22.32 | 0.999 |
| 22.33 | 0.999 |
| 22.34 | 0.999 |
| 22.35 | 0.999 |
| 22.36 | 0.999 |
| 22.37 | 0.999 |
| 22.38 | 0.999 |
| 22.39 | 0.999 |
| 22.4 | 0.999 |
| 22.41 | 0.999 |
| 22.42 | 0.999 |
| 22.43 | 0.999 |
| 22.44 | 0.999 |
| 22.45 | 0.999 |
| 22.46 | 0.999 |
| 22.47 | 0.999 |
| 22.48 | 0.999 |
| 22.49 | 0.999 |
| 22.5 | 0.999 |
| 22.51 | 0.999 |
| 22.52 | 0.999 |
| 22.53 | 0.999 |
| 22.54 | 0.999 |
| 22.55 | 0.999 |
| 22.56 | 0.999 |
| 22.57 | 0.999 |
| 22.58 | 0.999 |
| 22.59 | 0.999 |
| 22.6 | 0.999 |
| 22.61 | 0.999 |
| 22.62 | 0.999 |
| 22.63 | 0.999 |
| 22.64 | 0.999 |
| 22.65 | 0.999 |
| 22.66 | 0.999 |
| 22.67 | 0.999 |
| 22.68 | 0.999 |
| 22.69 | 0.999 |
| 22.7 | 0.999 |
| 22.71 | 0.999 |
| 22.72 | 0.999 |
| 22.73 | 0.999 |
| 22.74 | 0.999 |
| 22.75 | 0.999 |
| 22.76 | 0.999 |
| 22.77 | 0.999 |
| 22.78 | 0.999 |
| 22.79 | 0.999 |
| 22.8 | 0.999 |
| 22.81 | 0.999 |
| 22.82 | 0.999 |
| 22.83 | 0.999 |
| 22.84 | 0.999 |
| 22.85 | 0.999 |
| 22.86 | 0.999 |
| 22.87 | 0.999 |
| 22.88 | 0.999 |
| 22.89 | 0.999 |
| 22.9 | 0.999 |
| 22.91 | 0.999 |
| 22.92 | 0.999 |
| 22.93 | 0.999 |
| 22.94 | 0.999 |
| 22.95 | 0.999 |
| 22.96 | 0.999 |
| 22.97 | 0.999 |
| 22.98 | 0.999 |
| 22.99 | 0.999 |
| 23.0 | 0.999 |
| 23.01 | 0.999 |
| 23.02 | 0.999 |
| 23.03 | 0.999 |
| 23.04 | 0.999 |
| 23.05 | 0.999 |
| 23.06 | 0.999 |
| 23.07 | 0.999 |
| 23.08 | 0.999 |
| 23.09 | 0.999 |
| 23.1 | 0.999 |
| 23.11 | 0.999 |
| 23.12 | 0.999 |
| 23.13 | 0.999 |
| 23.14 | 0.999 |
| 23.15 | 0.999 |
| 23.16 | 0.999 |
| 23.17 | 0.999 |
| 23.18 | 0.999 |
| 23.19 | 0.999 |
| 23.2 | 0.999 |
| 23.21 | 0.999 |
| 23.22 | 0.999 |
| 23.23 | 0.999 |
| 23.24 | 0.999 |
| 23.25 | 0.999 |
| 23.26 | 0.999 |
| 23.27 | 0.999 |
| 23.28 | 0.999 |
| 23.29 | 0.999 |
| 23.3 | 0.999 |
| 23.31 | 0.999 |
| 23.32 | 0.999 |
| 23.33 | 0.999 |
| 23.34 | 0.999 |
| 23.35 | 0.999 |
| 23.36 | 0.999 |
| 23.37 | 0.999 |
| 23.38 | 0.999 |
| 23.39 | 0.999 |
| 23.4 | 0.999 |
| 23.41 | 0.999 |
| 23.42 | 0.999 |
| 23.43 | 0.999 |
| 23.44 | 0.999 |
| 23.45 | 0.999 |
| 23.46 | 0.999 |
| 23.47 | 0.999 |
| 23.48 | 0.999 |
| 23.49 | 0.999 |
| 23.5 | 0.999 |
| 23.51 | 0.999 |
| 23.52 | 0.999 |
| 23.53 | 0.999 |
| 23.54 | 0.999 |
| 23.55 | 0.999 |
| 23.56 | 0.999 |
| 23.57 | 0.999 |
| 23.58 | 0.999 |
| 23.59 | 0.999 |
| 23.6 | 0.999 |
| 23.61 | 0.999 |
| 23.62 | 0.999 |
| 23.63 | 0.999 |
| 23.64 | 0.999 |
| 23.65 | 0.999 |
| 23.66 | 0.999 |
| 23.67 | 0.999 |
| 23.68 | 0.999 |
| 23.69 | 0.999 |
| 23.7 | 0.999 |
| 23.71 | 0.999 |
| 23.72 | 0.999 |
| 23.73 | 0.999 |
| 23.74 | 0.999 |
| 23.75 | 0.999 |
| 23.76 | 0.999 |
| 23.77 | 0.999 |
| 23.78 | 0.999 |
| 23.79 | 0.999 |
| 23.8 | 0.999 |
| 23.81 | 0.999 |
| 23.82 | 0.999 |
| 23.83 | 0.999 |
| 23.84 | 0.999 |
| 23.85 | 0.999 |
| 23.86 | 0.999 |
| 23.87 | 0.999 |
| 23.88 | 0.999 |
| 23.89 | 0.999 |
| 23.9 | 0.999 |
| 23.91 | 0.999 |
| 23.92 | 0.999 |
| 23.93 | 0.999 |
| 23.94 | 0.999 |
| 23.95 | 0.999 |
| 23.96 | 0.999 |
| 23.97 | 0.999 |
| 23.98 | 0.999 |
| 23.99 | 0.999 |
| 24.0 | 0.999 |
| 24.01 | 0.999 |
| 24.02 | 0.999 |
| 24.03 | 0.999 |
| 24.04 | 0.999 |
| 24.05 | 0.999 |
| 24.06 | 0.999 |
| 24.07 | 0.999 |
| 24.08 | 0.999 |
| 24.09 | 0.999 |
| 24.1 | 0.999 |
| 24.11 | 0.999 |
| 24.12 | 0.999 |
| 24.13 | 0.999 |
| 24.14 | 0.999 |
| 24.15 | 0.999 |
| 24.16 | 0.999 |
| 24.17 | 0.999 |
| 24.18 | 0.999 |
| 24.19 | 0.999 |
| 24.2 | 0.999 |
| 24.21 | 0.999 |
| 24.22 | 0.999 |
| 24.23 | 0.999 |
| 24.24 | 0.999 |
| 24.25 | 0.999 |
| 24.26 | 0.999 |
| 24.27 | 0.999 |
| 24.28 | 0.999 |
| 24.29 | 0.999 |
| 24.3 | 0.999 |
| 24.31 | 0.999 |
| 24.32 | 0.999 |
| 24.33 | 0.999 |
| 24.34 | 0.999 |
| 24.35 | 0.999 |
| 24.36 | 0.999 |
| 24.37 | 0.999 |
| 24.38 | 0.999 |
| 24.39 | 0.999 |
| 24.4 | 0.999 |
| 24.41 | 0.999 |
| 24.42 | 0.999 |
| 24.43 | 0.999 |
| 24.44 | 0.999 |
| 24.45 | 0.999 |
| 24.46 | 0.999 |
| 24.47 | 0.999 |
| 24.48 | 0.999 |
| 24.49 | 0.999 |
| 24.5 | 0.999 |
| 24.51 | 0.999 |
| 24.52 | 0.999 |
| 24.53 | 0.999 |
| 24.54 | 0.999 |
| 24.55 | 0.999 |
| 24.56 | 0.999 |
| 24.57 | 0.999 |
| 24.58 | 0.999 |
| 24.59 | 0.999 |
| 24.6 | 0.999 |
| 24.61 | 0.999 |
| 24.62 | 0.999 |
| 24.63 | 0.999 |
| 24.64 | 0.999 |
| 24.65 | 0.999 |
| 24.66 | 0.999 |
| 24.67 | 0.999 |
| 24.68 | 0.999 |
| 24.69 | 0.999 |
| 24.7 | 0.999 |
| 24.71 | 0.999 |
| 24.72 | 0.999 |
| 24.73 | 0.999 |
| 24.74 | 0.999 |
| 24.75 | 0.999 |
| 24.76 | 0.999 |
| 24.77 | 0.999 |
| 24.78 | 0.999 |
| 24.79 | 0.999 |
| 24.8 | 0.999 |
| 24.81 | 0.999 |
| 24.82 | 0.999 |
| 24.83 | 0.999 |
| 24.84 | 0.999 |
| 24.85 | 0.999 |
| 24.86 | 0.999 |
| 24.87 | 0.999 |
| 24.88 | 0.999 |
| 24.89 | 0.999 |
| 24.9 | 0.999 |
| 24.91 | 0.999 |
| 24.92 | 0.999 |
| 24.93 | 0.999 |
| 24.94 | 0.999 |
| 24.95 | 0.999 |
| 24.96 | 0.999 |
| 24.97 | 0.999 |
| 24.98 | 0.999 |
| 24.99 | 0.999 |
| 25.0 | 0.999 |
| 25.01 | 0.999 |
| 25.02 | 0.999 |
| 25.03 | 0.999 |
| 25.04 | 0.999 |
| 25.05 | 0.999 |
| 25.06 | 0.999 |
| 25.07 | 0.999 |
| 25.08 | 0.999 |
| 25.09 | 0.999 |
| 25.1 | 0.999 |
| 25.11 | 0.999 |
| 25.12 | 0.999 |
| 25.13 | 0.999 |
| 25.14 | 0.999 |
| 25.15 | 0.999 |
| 25.16 | 0.999 |
| 25.17 | 0.999 |
| 25.18 | 0.999 |
| 25.19 | 0.999 |
| 25.2 | 0.999 |
| 25.21 | 0.999 |
| 25.22 | 0.999 |
| 25.23 | 0.999 |
| 25.24 | 0.999 |
| 25.25 | 0.999 |
| 25.26 | 0.999 |
| 25.27 | 0.999 |
| 25.28 | 0.999 |
| 25.29 | 0.999 |
| 25.3 | 0.999 |
| 25.31 | 0.999 |
| 25.32 | 0.999 |
| 25.33 | 0.999 |
| 25.34 | 0.999 |
| 25.35 | 0.999 |
| 25.36 | 0.999 |
| 25.37 | 0.999 |
| 25.38 | 0.999 |
| 25.39 | 0.999 |
| 25.4 | 0.999 |
| 25.41 | 0.999 |
| 25.42 | 0.999 |
| 25.43 | 0.999 |
| 25.44 | 0.999 |
| 25.45 | 0.999 |
| 25.46 | 0.999 |
| 25.47 | 0.999 |
| 25.48 | 0.999 |
| 25.49 | 0.999 |
| 25.5 | 0.999 |
| 25.51 | 0.999 |
| 25.52 | 0.999 |
| 25.53 | 0.999 |
| 25.54 | 0.999 |
| 25.55 | 0.999 |
| 25.56 | 0.999 |
| 25.57 | 0.999 |
| 25.58 | 0.999 |
| 25.59 | 0.999 |
| 25.6 | 0.999 |
| 25.61 | 0.999 |
| 25.62 | 0.999 |
| 25.63 | 0.999 |
| 25.64 | 0.999 |
| 25.65 | 0.999 |
| 25.66 | 0.999 |
| 25.67 | 0.999 |
| 25.68 | 0.999 |
| 25.69 | 0.999 |
| 25.7 | 0.999 |
| 25.71 | 0.999 |
| 25.72 | 0.999 |
| 25.73 | 0.999 |
| 25.74 | 0.999 |
| 25.75 | 0.999 |
| 25.76 | 0.999 |
| 25.77 | 0.999 |
| 25.78 | 0.999 |
| 25.79 | 0.999 |
| 25.8 | 0.999 |
| 25.81 | 0.999 |
| 25.82 | 0.999 |
| 25.83 | 0.999 |
| 25.84 | 0.999 |
| 25.85 | 0.999 |
| 25.86 | 0.999 |
| 25.87 | 0.999 |
| 25.88 | 0.999 |
| 25.89 | 0.999 |
| 25.9 | 0.999 |
| 25.91 | 0.999 |
| 25.92 | 0.999 |
| 25.93 | 0.999 |
| 25.94 | 0.999 |
| 25.95 | 0.999 |
| 25.96 | 0.999 |
| 25.97 | 0.999 |
| 25.98 | 0.999 |
| 25.99 | 0.999 |
| 26.0 | 0.999 |
| 26.01 | 0.999 |
| 26.02 | 0.999 |
| 26.03 | 0.999 |
| 26.04 | 0.999 |
| 26.05 | 0.999 |
| 26.06 | 0.999 |
| 26.07 | 0.999 |
| 26.08 | 0.999 |
| 26.09 | 0.999 |
| 26.1 | 0.999 |
| 26.11 | 0.999 |
| 26.12 | 0.999 |
| 26.13 | 0.999 |
| 26.14 | 0.999 |
| 26.15 | 0.999 |
| 26.16 | 0.999 |
| 26.17 | 0.999 |
| 26.18 | 0.999 |
| 26.19 | 0.999 |
| 26.2 | 0.999 |
| 26.21 | 0.999 |
| 26.22 | 0.999 |
| 26.23 | 0.999 |
| 26.24 | 0.999 |
| 26.25 | 0.999 |
| 26.26 | 0.999 |
| 26.27 | 0.999 |
| 26.28 | 0.999 |
| 26.29 | 0.999 |
| 26.3 | 0.999 |
| 26.31 | 0.999 |
| 26.32 | 0.999 |
| 26.33 | 0.999 |
| 26.34 | 0.999 |
| 26.35 | 0.999 |
| 26.36 | 0.999 |
| 26.37 | 0.999 |
| 26.38 | 0.999 |
| 26.39 | 0.999 |
| 26.4 | 0.999 |
| 26.41 | 0.999 |
| 26.42 | 0.999 |
| 26.43 | 0.999 |
| 26.44 | 0.999 |
| 26.45 | 0.999 |
| 26.46 | 0.999 |
| 26.47 | 0.999 |
| 26.48 | 0.999 |
| 26.49 | 0.999 |
| 26.5 | 0.999 |
| 26.51 | 0.999 |
| 26.52 | 0.999 |
| 26.53 | 0.999 |
| 26.54 | 0.999 |
| 26.55 | 0.999 |
| 26.56 | 0.999 |
| 26.57 | 0.999 |
| 26.58 | 0.999 |
| 26.59 | 0.999 |
| 26.6 | 0.999 |
| 26.61 | 0.999 |
| 26.62 | 0.999 |
| 26.63 | 0.999 |
| 26.64 | 0.999 |
| 26.65 | 0.999 |
| 26.66 | 0.999 |
| 26.67 | 0.999 |
| 26.68 | 0.999 |
| 26.69 | 0.999 |
| 26.7 | 0.999 |
| 26.71 | 0.999 |
| 26.72 | 0.999 |
| 26.73 | 0.999 |
| 26.74 | 0.999 |
| 26.75 | 0.999 |
| 26.76 | 0.999 |
| 26.77 | 0.999 |
| 26.78 | 0.999 |
| 26.79 | 0.999 |
| 26.8 | 0.999 |
| 26.81 | 0.999 |
| 26.82 | 0.999 |
| 26.83 | 0.999 |
| 26.84 | 0.999 |
| 26.85 | 0.999 |
| 26.86 | 0.999 |
| 26.87 | 0.999 |
| 26.88 | 0.999 |
| 26.89 | 0.999 |
| 26.9 | 0.999 |
| 26.91 | 0.999 |
| 26.92 | 0.999 |
| 26.93 | 0.999 |
| 26.94 | 0.999 |
| 26.95 | 0.999 |
| 26.96 | 0.999 |
| 26.97 | 0.999 |
| 26.98 | 0.999 |
| 26.99 | 0.999 |
| 27.0 | 0.999 |
| 27.01 | 0.999 |
| 27.02 | 0.999 |
| 27.03 | 0.999 |
| 27.04 | 0.999 |
| 27.05 | 0.999 |
| 27.06 | 0.999 |
| 27.07 | 0.999 |
| 27.08 | 0.999 |
| 27.09 | 0.999 |
| 27.1 | 0.999 |
| 27.11 | 0.999 |
| 27.12 | 0.999 |
| 27.13 | 0.999 |
| 27.14 | 0.999 |
| 27.15 | 0.999 |
| 27.16 | 0.999 |
| 27.17 | 0.999 |
| 27.18 | 0.999 |
| 27.19 | 0.999 |
| 27.2 | 0.999 |
| 27.21 | 0.999 |
| 27.22 | 0.999 |
| 27.23 | 0.999 |
| 27.24 | 0.999 |
| 27.25 | 0.999 |
| 27.26 | 0.999 |
| 27.27 | 0.999 |
| 27.28 | 0.999 |
| 27.29 | 0.999 |
| 27.3 | 0.999 |
| 27.31 | 0.999 |
| 27.32 | 0.999 |
| 27.33 | 0.999 |
| 27.34 | 0.999 |
| 27.35 | 0.999 |
| 27.36 | 0.999 |
| 27.37 | 0.999 |
| 27.38 | 0.999 |
| 27.39 | 0.999 |
| 27.4 | 0.999 |
| 27.41 | 0.999 |
| 27.42 | 0.999 |
| 27.43 | 0.999 |
| 27.44 | 0.999 |
| 27.45 | 0.999 |
| 27.46 | 0.999 |
| 27.47 | 0.999 |
| 27.48 | 0.999 |
| 27.49 | 0.999 |
| 27.5 | 0.999 |
| 27.51 | 0.999 |
| 27.52 | 0.999 |
| 27.53 | 0.999 |
| 27.54 | 0.999 |
| 27.55 | 0.999 |
| 27.56 | 0.999 |
| 27.57 | 0.999 |
| 27.58 | 0.999 |
| 27.59 | 0.999 |
| 27.6 | 0.999 |
| 27.61 | 0.999 |
| 27.62 | 0.999 |
| 27.63 | 0.999 |
| 27.64 | 0.999 |
| 27.65 | 0.999 |
| 27.66 | 0.999 |
| 27.67 | 0.999 |
| 27.68 | 0.999 |
| 27.69 | 0.999 |
| 27.7 | 0.999 |
| 27.71 | 0.999 |
| 27.72 | 0.999 |
| 27.73 | 0.999 |
| 27.74 | 0.999 |
| 27.75 | 0.999 |
| 27.76 | 0.999 |
| 27.77 | 0.999 |
| 27.78 | 0.999 |
| 27.79 | 0.999 |
| 27.8 | 0.999 |
| 27.81 | 0.999 |
| 27.82 | 0.999 |
| 27.83 | 0.999 |
| 27.84 | 0.999 |
| 27.85 | 0.999 |
| 27.86 | 0.999 |
| 27.87 | 0.999 |
| 27.88 | 0.999 |
| 27.89 | 0.999 |
| 27.9 | 0.999 |
| 27.91 | 0.999 |
| 27.92 | 0.999 |
| 27.93 | 0.999 |
| 27.94 | 0.999 |
| 27.95 | 0.999 |
| 27.96 | 0.999 |
| 27.97 | 0.999 |
| 27.98 | 0.999 |
| 27.99 | 0.999 |
| 28.0 | 0.999 |
| 28.01 | 0.999 |
| 28.02 | 0.999 |
| 28.03 | 0.999 |
| 28.04 | 0.999 |
| 28.05 | 0.999 |
| 28.06 | 0.999 |
| 28.07 | 0.999 |
| 28.08 | 0.999 |
| 28.09 | 0.999 |
| 28.1 | 0.999 |
| 28.11 | 0.999 |
| 28.12 | 0.999 |
| 28.13 | 0.999 |
| 28.14 | 0.999 |
| 28.15 | 0.999 |
| 28.16 | 0.999 |
| 28.17 | 0.999 |
| 28.18 | 0.999 |
| 28.19 | 0.999 |
| 28.2 | 0.999 |
| 28.21 | 0.999 |
| 28.22 | 0.999 |
| 28.23 | 0.999 |
| 28.24 | 0.999 |
| 28.25 | 0.999 |
| 28.26 | 0.999 |
| 28.27 | 0.999 |
| 28.28 | 0.999 |
| 28.29 | 0.999 |
| 28.3 | 0.999 |
| 28.31 | 0.999 |
| 28.32 | 0.999 |
| 28.33 | 0.999 |
| 28.34 | 0.999 |
| 28.35 | 0.999 |
| 28.36 | 0.999 |
| 28.37 | 0.999 |
| 28.38 | 0.999 |
| 28.39 | 0.999 |
| 28.4 | 0.999 |
| 28.41 | 0.999 |
| 28.42 | 0.999 |
| 28.43 | 0.999 |
| 28.44 | 0.999 |
| 28.45 | 0.999 |
| 28.46 | 0.999 |
| 28.47 | 0.999 |
| 28.48 | 0.999 |
| 28.49 | 0.999 |
| 28.5 | 0.999 |
| 28.51 | 0.999 |
| 28.52 | 0.999 |
| 28.53 | 0.999 |
| 28.54 | 0.999 |
| 28.55 | 0.999 |
| 28.56 | 0.999 |
| 28.57 | 0.999 |
| 28.58 | 0.999 |
| 28.59 | 0.999 |
| 28.6 | 0.999 |
| 28.61 | 0.999 |
| 28.62 | 0.999 |
| 28.63 | 0.999 |
| 28.64 | 0.999 |
| 28.65 | 0.999 |
| 28.66 | 0.999 |
| 28.67 | 0.999 |
| 28.68 | 0.999 |
| 28.69 | 0.999 |
| 28.7 | 0.999 |
| 28.71 | 0.999 |
| 28.72 | 0.999 |
| 28.73 | 0.999 |
| 28.74 | 0.999 |
| 28.75 | 0.999 |
| 28.76 | 0.999 |
| 28.77 | 0.999 |
| 28.78 | 0.999 |
| 28.79 | 0.999 |
| 28.8 | 0.999 |
| 28.81 | 0.999 |
| 28.82 | 0.999 |
| 28.83 | 0.999 |
| 28.84 | 0.999 |
| 28.85 | 0.999 |
| 28.86 | 0.999 |
| 28.87 | 0.999 |
| 28.88 | 0.999 |
| 28.89 | 0.999 |
| 28.9 | 0.999 |
| 28.91 | 0.999 |
| 28.92 | 0.999 |
| 28.93 | 0.999 |
| 28.94 | 0.999 |
| 28.95 | 0.999 |
| 28.96 | 0.999 |
| 28.97 | 0.999 |
| 28.98 | 0.999 |
| 28.99 | 0.999 |
| 29.0 | 0.999 |
| 29.01 | 0.999 |
| 29.02 | 0.999 |
| 29.03 | 0.999 |
| 29.04 | 0.999 |
| 29.05 | 0.999 |
| 29.06 | 0.999 |
| 29.07 | 0.999 |
| 29.08 | 0.999 |
| 29.09 | 0.999 |
| 29.1 | 0.999 |
| 29.11 | 0.999 |
| 29.12 | 0.999 |
| 29.13 | 0.999 |
| 29.14 | 0.999 |
| 29.15 | 0.999 |
| 29.16 | 0.999 |
| 29.17 | 0.999 |
| 29.18 | 0.999 |
| 29.19 | 0.999 |
| 29.2 | 0.999 |
| 29.21 | 0.999 |
| 29.22 | 0.999 |
| 29.23 | 0.999 |
| 29.24 | 0.999 |
| 29.25 | 0.999 |
| 29.26 | 0.999 |
| 29.27 | 0.999 |
| 29.28 | 0.999 |
| 29.29 | 0.999 |
| 29.3 | 0.999 |
| 29.31 | 0.999 |
| 29.32 | 0.999 |
| 29.33 | 0.999 |
| 29.34 | 0.999 |
| 29.35 | 0.999 |
| 29.36 | 0.999 |
| 29.37 | 0.999 |
| 29.38 | 0.999 |
| 29.39 | 0.999 |
| 29.4 | 0.999 |
| 29.41 | 0.999 |
| 29.42 | 0.999 |
| 29.43 | 0.999 |
| 29.44 | 0.999 |
| 29.45 | 0.999 |
| 29.46 | 0.999 |
| 29.47 | 0.999 |
| 29.48 | 0.999 |
| 29.49 | 0.999 |
| 29.5 | 0.999 |
| 29.51 | 0.999 |
| 29.52 | 0.999 |
| 29.53 | 0.999 |
| 29.54 | 0.999 |
| 29.55 | 0.999 |
| 29.56 | 0.999 |
| 29.57 | 0.999 |
| 29.58 | 0.999 |
| 29.59 | 0.999 |
| 29.6 | 0.999 |
| 29.61 | 0.999 |
| 29.62 | 0.999 |
| 29.63 | 0.999 |
| 29.64 | 0.999 |
| 29.65 | 0.999 |
| 29.66 | 0.999 |
| 29.67 | 0.999 |
| 29.68 | 0.999 |
| 29.69 | 0.999 |
| 29.7 | 0.999 |
| 29.71 | 0.999 |
| 29.72 | 0.999 |
| 29.73 | 0.999 |
| 29.74 | 0.999 |
| 29.75 | 0.999 |
| 29.76 | 0.999 |
| 29.77 | 0.999 |
| 29.78 | 0.999 |
| 29.79 | 0.999 |
| 29.8 | 0.999 |
| 29.81 | 0.999 |
| 29.82 | 0.999 |
| 29.83 | 0.999 |
| 29.84 | 0.999 |
| 29.85 | 0.999 |
| 29.86 | 0.999 |
| 29.87 | 0.999 |
| 29.88 | 0.999 |
| 29.89 | 0.999 |
| 29.9 | 0.999 |
| 29.91 | 0.999 |
| 29.92 | 0.999 |
| 29.93 | 0.999 |
| 29.94 | 0.999 |
| 29.95 | 0.999 |
| 29.96 | 0.999 |
| 29.97 | 0.999 |
| 29.98 | 0.999 |
| 29.99 | 0.999 |
| 30.0 | 0.999 |
| 30.01 | 0.999 |
| 30.02 | 0.999 |
| 30.03 | 0.999 |
| 30.04 | 0.999 |
| 30.05 | 0.999 |
| 30.06 | 0.999 |
| 30.07 | 0.999 |
| 30.08 | 0.999 |
| 30.09 | 0.999 |
| 30.1 | 0.999 |
| 30.11 | 0.999 |
| 30.12 | 0.999 |
| 30.13 | 0.999 |
| 30.14 | 0.999 |
| 30.15 | 0.999 |
| 30.16 | 0.999 |
| 30.17 | 0.999 |
| 30.18 | 0.999 |
| 30.19 | 0.999 |
| 30.2 | 0.999 |
| 30.21 | 0.999 |
| 30.22 | 0.999 |
| 30.23 | 0.999 |
| 30.24 | 0.999 |
| 30.25 | 0.999 |
| 30.26 | 0.999 |
| 30.27 | 0.999 |
| 30.28 | 0.999 |
| 30.29 | 0.999 |
| 30.3 | 0.999 |
| 30.31 | 0.999 |
| 30.32 | 0.999 |
| 30.33 | 0.999 |
| 30.34 | 0.999 |
| 30.35 | 0.999 |
| 30.36 | 0.999 |
| 30.37 | 0.999 |
| 30.38 | 0.999 |
| 30.39 | 0.999 |
| 30.4 | 0.999 |
| 30.41 | 0.999 |
| 30.42 | 0.999 |
| 30.43 | 0.999 |
| 30.44 | 0.999 |
| 30.45 | 0.999 |
| 30.46 | 0.999 |
| 30.47 | 0.999 |
| 30.48 | 0.999 |
| 30.49 | 0.999 |
| 30.5 | 0.999 |
| 30.51 | 0.999 |
| 30.52 | 0.999 |
| 30.53 | 0.999 |
| 30.54 | 0.999 |
| 30.55 | 0.999 |
| 30.56 | 0.999 |
| 30.57 | 0.999 |
| 30.58 | 0.999 |
| 30.59 | 0.999 |
| 30.6 | 0.999 |
| 30.61 | 0.999 |
| 30.62 | 0.999 |
| 30.63 | 0.999 |
| 30.64 | 0.999 |
| 30.65 | 0.999 |
| 30.66 | 0.999 |
| 30.67 | 0.999 |
| 30.68 | 0.999 |
| 30.69 | 0.999 |
| 30.7 | 0.999 |
| 30.71 | 0.999 |
| 30.72 | 0.999 |
| 30.73 | 0.999 |
| 30.74 | 0.999 |
| 30.75 | 0.999 |
| 30.76 | 0.999 |
| 30.77 | 0.999 |
| 30.78 | 0.999 |
| 30.79 | 0.999 |
| 30.8 | 0.999 |
| 30.81 | 0.999 |
| 30.82 | 0.999 |
| 30.83 | 0.999 |
| 30.84 | 0.999 |
| 30.85 | 0.999 |
| 30.86 | 0.999 |
| 30.87 | 0.999 |
| 30.88 | 0.999 |
| 30.89 | 0.999 |
| 30.9 | 0.999 |
| 30.91 | 0.999 |
| 30.92 | 0.999 |
| 30.93 | 0.999 |
| 30.94 | 0.999 |
| 30.95 | 0.999 |
| 30.96 | 0.999 |
| 30.97 | 0.999 |
| 30.98 | 0.999 |
| 30.99 | 0.999 |
| 31.0 | 0.999 |
| 31.01 | 0.999 |
| 31.02 | 0.999 |
| 31.03 | 0.999 |
| 31.04 | 0.999 |
| 31.05 | 0.999 |
| 31.06 | 0.999 |
| 31.07 | 0.999 |
| 31.08 | 0.999 |
| 31.09 | 0.999 |
| 31.1 | 0.999 |
| 31.11 | 0.999 |
| 31.12 | 0.999 |
| 31.13 | 0.999 |
| 31.14 | 0.999 |
| 31.15 | 0.999 |
| 31.16 | 0.999 |
| 31.17 | 0.999 |
| 31.18 | 0.999 |
| 31.19 | 0.999 |
| 31.2 | 0.999 |
| 31.21 | 0.999 |
| 31.22 | 0.999 |
| 31.23 | 0.999 |
| 31.24 | 0.999 |
| 31.25 | 0.999 |
| 31.26 | 0.999 |
| 31.27 | 0.999 |
| 31.28 | 0.999 |
| 31.29 | 0.999 |
| 31.3 | 0.999 |
| 31.31 | 0.999 |
| 31.32 | 0.999 |
| 31.33 | 0.999 |
| 31.34 | 0.999 |
| 31.35 | 0.999 |
| 31.36 | 0.999 |
| 31.37 | 0.999 |
| 31.38 | 0.999 |
| 31.39 | 0.999 |
| 31.4 | 0.999 |
| 31.41 | 0.999 |
| 31.42 | 0.999 |
| 31.43 | 0.999 |
| 31.44 | 0.999 |
| 31.45 | 0.999 |
| 31.46 | 0.999 |
| 31.47 | 0.999 |
| 31.48 | 0.999 |
| 31.49 | 0.999 |
| 31.5 | 0.999 |
| 31.51 | 0.999 |
| 31.52 | 0.999 |
| 31.53 | 0.999 |
| 31.54 | 0.999 |
| 31.55 | 0.999 |
| 31.56 | 0.999 |
| 31.57 | 0.999 |
| 31.58 | 0.999 |
| 31.59 | 0.999 |
| 31.6 | 0.999 |
| 31.61 | 0.999 |
| 31.62 | 0.999 |
| 31.63 | 0.999 |
| 31.64 | 0.999 |
| 31.65 | 0.999 |
| 31.66 | 0.999 |
| 31.67 | 0.999 |
| 31.68 | 0.999 |
| 31.69 | 0.999 |
| 31.7 | 0.999 |
| 31.71 | 0.999 |
| 31.72 | 0.999 |
| 31.73 | 0.999 |
| 31.74 | 0.999 |
| 31.75 | 0.999 |
| 31.76 | 0.999 |
| 31.77 | 0.999 |
| 31.78 | 0.999 |
| 31.79 | 0.999 |
| 31.8 | 0.999 |
| 31.81 | 0.999 |
| 31.82 | 0.999 |
| 31.83 | 0.999 |
| 31.84 | 0.999 |
| 31.85 | 0.999 |
| 31.86 | 0.999 |
| 31.87 | 0.999 |
| 31.88 | 0.999 |
| 31.89 | 0.999 |
| 31.9 | 0.999 |
| 31.91 | 0.999 |
| 31.92 | 0.999 |
| 31.93 | 0.999 |
| 31.94 | 0.999 |
| 31.95 | 0.999 |
| 31.96 | 0.999 |
| 31.97 | 0.999 |
| 31.98 | 0.999 |
| 31.99 | 0.999 |
| 32.0 | 0.999 |
| 32.01 | 0.999 |
| 32.02 | 0.999 |
| 32.03 | 0.999 |
| 32.04 | 0.999 |
| 32.05 | 0.999 |
| 32.06 | 0.999 |
| 32.07 | 0.999 |
| 32.08 | 0.999 |
| 32.09 | 0.999 |
| 32.1 | 0.999 |
| 32.11 | 0.999 |
| 32.12 | 0.999 |
| 32.13 | 0.999 |
| 32.14 | 0.999 |
| 32.15 | 0.999 |
| 32.16 | 0.999 |
| 32.17 | 0.999 |
| 32.18 | 0.999 |
| 32.19 | 0.999 |
| 32.2 | 0.999 |
| 32.21 | 0.999 |
| 32.22 | 0.999 |
| 32.23 | 0.999 |
| 32.24 | 0.999 |
| 32.25 | 0.999 |
| 32.26 | 0.999 |
| 32.27 | 0.999 |
| 32.28 | 0.999 |
| 32.29 | 0.999 |
| 32.3 | 0.999 |
| 32.31 | 0.999 |
| 32.32 | 0.999 |
| 32.33 | 0.999 |
| 32.34 | 0.999 |
| 32.35 | 0.999 |
| 32.36 | 0.999 |
| 32.37 | 0.999 |
| 32.38 | 0.999 |
| 32.39 | 0.999 |
| 32.4 | 0.999 |
| 32.41 | 0.999 |
| 32.42 | 0.999 |
| 32.43 | 0.999 |
| 32.44 | 0.999 |
| 32.45 | 0.999 |
| 32.46 | 0.999 |
| 32.47 | 0.999 |
| 32.48 | 0.999 |
| 32.49 | 0.999 |
| 32.5 | 0.999 |
| 32.51 | 0.999 |
| 32.52 | 0.999 |
| 32.53 | 0.999 |
| 32.54 | 0.999 |
| 32.55 | 0.999 |
| 32.56 | 0.999 |
| 32.57 | 0.999 |
| 32.58 | 0.999 |
| 32.59 | 0.999 |
| 32.6 | 0.999 |
| 32.61 | 0.999 |
| 32.62 | 0.999 |
| 32.63 | 0.999 |
| 32.64 | 0.999 |
| 32.65 | 0.999 |
| 32.66 | 0.999 |
| 32.67 | 0.999 |
| 32.68 | 0.999 |
| 32.69 | 0.999 |
| 32.7 | 0.999 |
| 32.71 | 0.999 |
| 32.72 | 0.999 |
| 32.73 | 0.999 |
| 32.74 | 0.999 |
| 32.75 | 0.999 |
| 32.76 | 0.999 |
| 32.77 | 0.999 |
| 32.78 | 0.999 |
| 32.79 | 0.999 |
| 32.8 | 0.999 |
| 32.81 | 0.999 |
| 32.82 | 0.999 |
| 32.83 | 0.999 |
| 32.84 | 0.999 |
| 32.85 | 0.999 |
| 32.86 | 0.999 |
| 32.87 | 0.999 |
| 32.88 | 0.999 |
| 32.89 | 0.999 |
| 32.9 | 0.999 |
| 32.91 | 0.999 |
| 32.92 | 0.999 |
| 32.93 | 0.999 |
| 32.94 | 0.999 |
| 32.95 | 0.999 |
| 32.96 | 0.999 |
| 32.97 | 0.999 |
| 32.98 | 0.999 |
| 32.99 | 0.999 |
| 33.0 | 0.999 |
| 33.01 | 0.999 |
| 33.02 | 0.999 |
| 33.03 | 0.999 |
| 33.04 | 0.999 |
| 33.05 | 0.999 |
| 33.06 | 0.999 |
| 33.07 | 0.999 |
| 33.08 | 0.999 |
| 33.09 | 0.999 |
| 33.1 | 0.999 |
| 33.11 | 0.999 |
| 33.12 | 0.999 |
| 33.13 | 0.999 |
| 33.14 | 0.999 |
| 33.15 | 0.999 |
| 33.16 | 0.999 |
| 33.17 | 0.999 |
| 33.18 | 0.999 |
| 33.19 | 0.999 |
| 33.2 | 0.999 |
| 33.21 | 0.999 |
| 33.22 | 0.999 |
| 33.23 | 0.999 |
| 33.24 | 0.999 |
| 33.25 | 0.999 |
| 33.26 | 0.999 |
| 33.27 | 0.999 |
| 33.28 | 0.999 |
| 33.29 | 0.999 |
| 33.3 | 0.999 |
| 33.31 | 0.999 |
| 33.32 | 0.999 |
| 33.33 | 0.999 |
| 33.34 | 0.999 |
| 33.35 | 0.999 |
| 33.36 | 0.999 |
| 33.37 | 0.999 |
| 33.38 | 0.999 |
| 33.39 | 0.999 |
| 33.4 | 0.999 |
| 33.41 | 0.999 |
| 33.42 | 0.999 |
| 33.43 | 0.999 |
| 33.44 | 0.999 |
| 33.45 | 0.999 |
| 33.46 | 0.999 |
| 33.47 | 0.999 |
| 33.48 | 0.999 |
| 33.49 | 0.999 |
| 33.5 | 0.999 |
| 33.51 | 0.999 |
| 33.52 | 0.999 |
| 33.53 | 0.999 |
| 33.54 | 0.999 |
| 33.55 | 0.999 |
| 33.56 | 0.999 |
| 33.57 | 0.999 |
| 33.58 | 0.999 |
| 33.59 | 0.999 |
| 33.6 | 0.999 |
| 33.61 | 0.999 |
| 33.62 | 0.999 |
| 33.63 | 0.999 |
| 33.64 | 0.999 |
| 33.65 | 0.999 |
| 33.66 | 0.999 |
| 33.67 | 0.999 |
| 33.68 | 0.999 |
| 33.69 | 0.999 |
| 33.7 | 0.999 |
| 33.71 | 0.999 |
| 33.72 | 0.999 |
| 33.73 | 0.999 |
| 33.74 | 0.999 |
| 33.75 | 0.999 |
| 33.76 | 0.999 |
| 33.77 | 0.999 |
| 33.78 | 0.999 |
| 33.79 | 0.999 |
| 33.8 | 0.999 |
| 33.81 | 0.999 |
| 33.82 | 0.999 |
| 33.83 | 0.999 |
| 33.84 | 0.999 |
| 33.85 | 0.999 |
| 33.86 | 0.999 |
| 33.87 | 0.999 |
| 33.88 | 0.999 |
| 33.89 | 0.999 |
| 33.9 | 0.999 |
| 33.91 | 0.999 |
| 33.92 | 0.999 |
| 33.93 | 0.999 |
| 33.94 | 0.999 |
| 33.95 | 0.999 |
| 33.96 | 0.999 |
| 33.97 | 0.999 |
| 33.98 | 0.999 |
| 33.99 | 0.999 |
| 34.0 | 0.999 |
| 34.01 | 0.999 |
| 34.02 | 0.999 |
| 34.03 | 0.999 |
| 34.04 | 0.999 |
| 34.05 | 0.999 |
| 34.06 | 0.999 |
| 34.07 | 0.999 |
| 34.08 | 0.999 |
| 34.09 | 0.999 |
| 34.1 | 0.999 |
| 34.11 | 0.999 |
| 34.12 | 0.999 |
| 34.13 | 0.999 |
| 34.14 | 0.999 |
| 34.15 | 0.999 |
| 34.16 | 0.999 |
| 34.17 | 0.999 |
| 34.18 | 0.999 |
| 34.19 | 0.999 |
| 34.2 | 0.999 |
| 34.21 | 0.999 |
| 34.22 | 0.999 |
| 34.23 | 0.999 |
| 34.24 | 0.999 |
| 34.25 | 0.999 |
| 34.26 | 0.999 |
| 34.27 | 0.999 |
| 34.28 | 0.999 |
| 34.29 | 0.999 |
| 34.3 | 0.999 |
| 34.31 | 0.999 |
| 34.32 | 0.999 |
| 34.33 | 0.999 |
| 34.34 | 0.999 |
| 34.35 | 0.999 |
| 34.36 | 0.999 |
| 34.37 | 0.999 |
| 34.38 | 0.999 |
| 34.39 | 0.999 |
| 34.4 | 0.999 |
| 34.41 | 0.999 |
| 34.42 | 0.999 |
| 34.43 | 0.999 |
| 34.44 | 0.999 |
| 34.45 | 0.999 |
| 34.46 | 0.999 |
| 34.47 | 0.999 |
| 34.48 | 0.999 |
| 34.49 | 0.999 |
| 34.5 | 0.999 |
| 34.51 | 0.999 |
| 34.52 | 0.999 |
| 34.53 | 0.999 |
| 34.54 | 0.999 |
| 34.55 | 0.999 |
| 34.56 | 0.999 |
| 34.57 | 0.999 |
| 34.58 | 0.999 |
| 34.59 | 0.999 |
| 34.6 | 0.999 |
| 34.61 | 0.999 |
| 34.62 | 0.999 |
| 34.63 | 0.999 |
| 34.64 | 0.999 |
| 34.65 | 0.999 |
| 34.66 | 0.999 |
| 34.67 | 0.999 |
| 34.68 | 0.999 |
| 34.69 | 0.999 |
| 34.7 | 0.999 |
| 34.71 | 0.999 |
| 34.72 | 0.999 |
| 34.73 | 0.999 |
| 34.74 | 0.999 |
| 34.75 | 0.999 |
| 34.76 | 0.999 |
| 34.77 | 0.999 |
| 34.78 | 0.999 |
| 34.79 | 0.999 |
| 34.8 | 0.999 |
| 34.81 | 0.999 |
| 34.82 | 0.999 |
| 34.83 | 0.999 |
| 34.84 | 0.999 |
| 34.85 | 0.999 |
| 34.86 | 0.999 |
| 34.87 | 0.999 |
| 34.88 | 0.999 |
| 34.89 | 0.999 |
| 34.9 | 0.999 |
| 34.91 | 0.999 |
| 34.92 | 0.999 |
| 34.93 | 0.999 |
| 34.94 | 0.999 |
| 34.95 | 0.999 |
| 34.96 | 0.999 |
| 34.97 | 0.999 |
| 34.98 | 0.999 |
| 34.99 | 0.999 |
| 35.0 | 0.999 |
| 35.01 | 0.999 |
| 35.02 | 0.999 |
| 35.03 | 0.999 |
| 35.04 | 0.999 |
| 35.05 | 0.999 |
| 35.06 | 0.999 |
| 35.07 | 0.999 |
| 35.08 | 0.999 |
| 35.09 | 0.999 |
| 35.1 | 0.999 |
| 35.11 | 0.999 |
| 35.12 | 0.999 |
| 35.13 | 0.999 |
| 35.14 | 0.999 |
| 35.15 | 0.999 |
| 35.16 | 0.999 |
| 35.17 | 0.999 |
| 35.18 | 0.999 |
| 35.19 | 0.999 |
| 35.2 | 0.999 |
| 35.21 | 0.999 |
| 35.22 | 0.999 |
| 35.23 | 0.999 |
| 35.24 | 0.999 |
| 35.25 | 0.999 |
| 35.26 | 0.999 |
| 35.27 | 0.999 |
| 35.28 | 0.999 |
| 35.29 | 0.999 |
| 35.3 | 0.999 |
| 35.31 | 0.999 |
| 35.32 | 0.999 |
| 35.33 | 0.999 |
| 35.34 | 0.999 |
| 35.35 | 0.999 |
| 35.36 | 0.999 |
| 35.37 | 0.999 |
| 35.38 | 0.999 |
| 35.39 | 0.999 |
| 35.4 | 0.999 |
| 35.41 | 0.999 |
| 35.42 | 0.999 |
| 35.43 | 0.999 |
| 35.44 | 0.999 |
| 35.45 | 0.999 |
| 35.46 | 0.999 |
| 35.47 | 0.999 |
| 35.48 | 0.999 |
| 35.49 | 0.999 |
| 35.5 | 0.999 |
| 35.51 | 0.999 |
| 35.52 | 0.999 |
| 35.53 | 0.999 |
| 35.54 | 0.999 |
| 35.55 | 0.999 |
| 35.56 | 0.999 |
| 35.57 | 0.999 |
| 35.58 | 0.999 |
| 35.59 | 0.999 |
| 35.6 | 0.999 |
| 35.61 | 0.999 |
| 35.62 | 0.999 |
| 35.63 | 0.999 |
| 35.64 | 0.999 |
| 35.65 | 0.999 |
| 35.66 | 0.999 |
| 35.67 | 0.999 |
| 35.68 | 0.999 |
| 35.69 | 0.999 |
| 35.7 | 0.999 |
| 35.71 | 0.999 |
| 35.72 | 0.999 |
| 35.73 | 0.999 |
| 35.74 | 0.999 |
| 35.75 | 0.999 |
| 35.76 | 0.999 |
| 35.77 | 0.999 |
| 35.78 | 0.999 |
| 35.79 | 0.999 |
| 35.8 | 0.999 |
| 35.81 | 0.999 |
| 35.82 | 0.999 |
| 35.83 | 0.999 |
| 35.84 | 0.999 |
| 35.85 | 0.999 |
| 35.86 | 0.999 |
| 35.87 | 0.999 |
| 35.88 | 0.999 |
| 35.89 | 0.999 |
| 35.9 | 0.999 |
| 35.91 | 0.999 |
| 35.92 | 0.999 |
| 35.93 | 0.999 |
| 35.94 | 0.999 |
| 35.95 | 0.999 |
| 35.96 | 0.999 |
| 35.97 | 0.999 |
| 35.98 | 0.999 |
| 35.99 | 0.999 |
| 36.0 | 0.999 |
| 36.01 | 0.999 |
| 36.02 | 0.999 |
| 36.03 | 0.999 |
| 36.04 | 0.999 |
| 36.05 | 0.999 |
| 36.06 | 0.999 |
| 36.07 | 0.999 |
| 36.08 | 0.999 |
| 36.09 | 0.999 |
| 36.1 | 0.999 |
| 36.11 | 0.999 |
| 36.12 | 0.999 |
| 36.13 | 0.999 |
| 36.14 | 0.999 |
| 36.15 | 0.999 |
| 36.16 | 0.999 |
| 36.17 | 0.999 |
| 36.18 | 0.999 |
| 36.19 | 0.999 |
| 36.2 | 0.999 |
| 36.21 | 0.999 |
| 36.22 | 0.999 |
| 36.23 | 0.999 |
| 36.24 | 0.999 |
| 36.25 | 0.999 |
| 36.26 | 0.999 |
| 36.27 | 0.999 |
| 36.28 | 0.999 |
| 36.29 | 0.999 |
| 36.3 | 0.999 |
| 36.31 | 0.999 |
| 36.32 | 0.999 |
| 36.33 | 0.999 |
| 36.34 | 0.999 |
| 36.35 | 0.999 |
| 36.36 | 0.999 |
| 36.37 | 0.999 |
| 36.38 | 0.999 |
| 36.39 | 0.999 |
| 36.4 | 0.999 |
| 36.41 | 0.999 |
| 36.42 | 0.999 |
| 36.43 | 0.999 |
| 36.44 | 0.999 |
| 36.45 | 0.999 |
| 36.46 | 0.999 |
| 36.47 | 0.999 |
| 36.48 | 0.999 |
| 36.49 | 0.999 |
| 36.5 | 0.999 |
| 36.51 | 0.999 |
| 36.52 | 0.999 |
| 36.53 | 0.999 |
| 36.54 | 0.999 |
| 36.55 | 0.999 |
| 36.56 | 0.999 |
| 36.57 | 0.999 |
| 36.58 | 0.999 |
| 36.59 | 0.999 |
| 36.6 | 0.999 |
| 36.61 | 0.999 |
| 36.62 | 0.999 |
| 36.63 | 0.999 |
| 36.64 | 0.999 |
| 36.65 | 0.999 |
| 36.66 | 0.999 |
| 36.67 | 0.999 |
| 36.68 | 0.999 |
| 36.69 | 0.999 |
| 36.7 | 0.999 |
| 36.71 | 0.999 |
| 36.72 | 0.999 |
| 36.73 | 0.999 |
| 36.74 | 0.999 |
| 36.75 | 0.999 |
| 36.76 | 0.999 |
| 36.77 | 0.999 |
| 36.78 | 0.999 |
| 36.79 | 0.999 |
| 36.8 | 0.999 |
| 36.81 | 0.999 |
| 36.82 | 0.999 |
| 36.83 | 0.999 |
| 36.84 | 0.999 |
| 36.85 | 0.999 |
| 36.86 | 0.999 |
| 36.87 | 0.999 |
| 36.88 | 0.999 |
| 36.89 | 0.999 |
| 36.9 | 0.999 |
| 36.91 | 0.999 |
| 36.92 | 0.999 |
| 36.93 | 0.999 |
| 36.94 | 0.999 |
| 36.95 | 0.999 |
| 36.96 | 0.999 |
| 36.97 | 0.999 |
| 36.98 | 0.999 |
| 36.99 | 0.999 |
| 37.0 | 0.999 |
| 37.01 | 0.999 |
| 37.02 | 0.999 |
| 37.03 | 0.999 |
| 37.04 | 0.999 |
| 37.05 | 0.999 |
| 37.06 | 0.999 |
| 37.07 | 0.999 |
| 37.08 | 0.999 |
| 37.09 | 0.999 |
| 37.1 | 0.999 |
| 37.11 | 0.999 |
| 37.12 | 0.999 |
| 37.13 | 0.999 |
| 37.14 | 0.999 |
| 37.15 | 0.999 |
| 37.16 | 0.999 |
| 37.17 | 0.999 |
| 37.18 | 0.999 |
| 37.19 | 0.999 |
| 37.2 | 0.999 |
| 37.21 | 0.999 |
| 37.22 | 0.999 |
| 37.23 | 0.999 |
| 37.24 | 0.999 |
| 37.25 | 0.999 |
| 37.26 | 0.999 |
| 37.27 | 0.999 |
| 37.28 | 0.999 |
| 37.29 | 0.999 |
| 37.3 | 0.999 |
| 37.31 | 0.999 |
| 37.32 | 0.999 |
| 37.33 | 0.999 |
| 37.34 | 0.999 |
| 37.35 | 0.999 |
| 37.36 | 0.999 |
| 37.37 | 0.999 |
| 37.38 | 0.999 |
| 37.39 | 0.999 |
| 37.4 | 0.999 |
| 37.41 | 0.999 |
| 37.42 | 0.999 |
| 37.43 | 0.999 |
| 37.44 | 0.999 |
| 37.45 | 0.999 |
| 37.46 | 0.999 |
| 37.47 | 0.999 |
| 37.48 | 0.999 |
| 37.49 | 0.999 |
| 37.5 | 0.999 |
| 37.51 | 0.999 |
| 37.52 | 0.999 |
| 37.53 | 0.999 |
| 37.54 | 0.999 |
| 37.55 | 0.999 |
| 37.56 | 0.999 |
| 37.57 | 0.999 |
| 37.58 | 0.999 |
| 37.59 | 0.999 |
| 37.6 | 0.999 |
| 37.61 | 0.999 |
| 37.62 | 0.999 |
| 37.63 | 0.999 |
| 37.64 | 0.999 |
| 37.65 | 0.999 |
| 37.66 | 0.999 |
| 37.67 | 0.999 |
| 37.68 | 0.999 |
| 37.69 | 0.999 |
| 37.7 | 0.999 |
| 37.71 | 0.999 |
| 37.72 | 0.999 |
| 37.73 | 0.999 |
| 37.74 | 0.999 |
| 37.75 | 0.999 |
| 37.76 | 0.999 |
| 37.77 | 0.999 |
| 37.78 | 0.999 |
| 37.79 | 0.999 |
| 37.8 | 0.999 |
| 37.81 | 0.999 |
| 37.82 | 0.999 |
| 37.83 | 0.999 |
| 37.84 | 0.999 |
| 37.85 | 0.999 |
| 37.86 | 0.999 |
| 37.87 | 0.999 |
| 37.88 | 0.999 |
| 37.89 | 0.999 |
| 37.9 | 0.999 |
| 37.91 | 0.999 |
| 37.92 | 0.999 |
| 37.93 | 0.999 |
| 37.94 | 0.999 |
| 37.95 | 0.999 |
| 37.96 | 0.999 |
| 37.97 | 0.999 |
| 37.98 | 0.999 |
| 37.99 | 0.999 |
| 38.0 | 0.999 |
| 38.01 | 0.999 |
| 38.02 | 0.999 |
| 38.03 | 0.999 |
| 38.04 | 0.999 |
| 38.05 | 0.999 |
| 38.06 | 0.999 |
| 38.07 | 0.999 |
| 38.08 | 0.999 |
| 38.09 | 0.999 |
| 38.1 | 0.999 |
| 38.11 | 0.999 |
| 38.12 | 0.999 |
| 38.13 | 0.999 |
| 38.14 | 0.999 |
| 38.15 | 0.999 |
| 38.16 | 0.999 |
| 38.17 | 0.999 |
| 38.18 | 0.999 |
| 38.19 | 0.999 |
| 38.2 | 0.999 |
| 38.21 | 0.999 |
| 38.22 | 0.999 |
| 38.23 | 0.999 |
| 38.24 | 0.999 |
| 38.25 | 0.999 |
| 38.26 | 0.999 |
| 38.27 | 0.999 |
| 38.28 | 0.999 |
| 38.29 | 0.999 |
| 38.3 | 0.999 |
| 38.31 | 0.999 |
| 38.32 | 0.999 |
| 38.33 | 0.999 |
| 38.34 | 0.999 |
| 38.35 | 0.999 |
| 38.36 | 0.999 |
| 38.37 | 0.999 |
| 38.38 | 0.999 |
| 38.39 | 0.999 |
| 38.4 | 0.999 |
| 38.41 | 0.999 |
| 38.42 | 0.999 |
| 38.43 | 0.999 |
| 38.44 | 0.999 |
| 38.45 | 0.999 |
| 38.46 | 0.999 |
| 38.47 | 0.999 |
| 38.48 | 0.999 |
| 38.49 | 0.999 |
| 38.5 | 0.999 |
| 38.51 | 0.999 |
| 38.52 | 0.999 |
| 38.53 | 0.999 |
| 38.54 | 0.999 |
| 38.55 | 0.999 |
| 38.56 | 0.999 |
| 38.57 | 0.999 |
| 38.58 | 0.999 |
| 38.59 | 0.999 |
| 38.6 | 0.999 |
| 38.61 | 0.999 |
| 38.62 | 0.999 |
| 38.63 | 0.999 |
| 38.64 | 0.999 |
| 38.65 | 0.999 |
| 38.66 | 0.999 |
| 38.67 | 0.999 |
| 38.68 | 0.999 |
| 38.69 | 0.999 |
| 38.7 | 0.999 |
| 38.71 | 0.999 |
| 38.72 | 0.999 |
| 38.73 | 0.999 |
| 38.74 | 0.999 |
| 38.75 | 0.999 |
| 38.76 | 0.999 |
| 38.77 | 0.999 |
| 38.78 | 0.999 |
| 38.79 | 0.999 |
| 38.8 | 0.999 |
| 38.81 | 0.999 |
| 38.82 | 0.999 |
| 38.83 | 0.999 |
| 38.84 | 0.999 |
| 38.85 | 0.999 |
| 38.86 | 0.999 |
| 38.87 | 0.999 |
| 38.88 | 0.999 |
| 38.89 | 0.999 |
| 38.9 | 0.999 |
| 38.91 | 0.999 |
| 38.92 | 0.999 |
| 38.93 | 0.999 |
| 38.94 | 0.999 |
| 38.95 | 0.999 |
| 38.96 | 0.999 |
| 38.97 | 0.999 |
| 38.98 | 0.999 |
| 38.99 | 0.999 |
| 39.0 | 0.999 |
| 39.01 | 0.999 |
| 39.02 | 0.999 |
| 39.03 | 0.999 |
| 39.04 | 0.999 |
| 39.05 | 0.999 |
| 39.06 | 0.999 |
| 39.07 | 0.999 |
| 39.08 | 0.999 |
| 39.09 | 0.999 |
| 39.1 | 0.999 |
| 39.11 | 0.999 |
| 39.12 | 0.999 |
| 39.13 | 0.999 |
| 39.14 | 0.999 |
| 39.15 | 0.999 |
| 39.16 | 0.999 |
| 39.17 | 0.999 |
| 39.18 | 0.999 |
| 39.19 | 0.999 |
| 39.2 | 0.999 |
| 39.21 | 0.999 |
| 39.22 | 0.999 |
| 39.23 | 0.999 |
| 39.24 | 0.999 |
| 39.25 | 0.999 |
| 39.26 | 0.999 |
| 39.27 | 0.999 |
| 39.28 | 0.999 |
| 39.29 | 0.999 |
| 39.3 | 0.999 |
| 39.31 | 0.999 |
| 39.32 | 0.999 |
| 39.33 | 0.999 |
| 39.34 | 0.999 |
| 39.35 | 0.999 |
| 39.36 | 0.999 |
| 39.37 | 0.999 |
| 39.38 | 0.999 |
| 39.39 | 0.999 |
| 39.4 | 0.999 |
| 39.41 | 0.999 |
| 39.42 | 0.999 |
| 39.43 | 0.999 |
| 39.44 | 0.999 |
| 39.45 | 0.999 |
| 39.46 | 0.999 |
| 39.47 | 0.999 |
| 39.48 | 0.999 |
| 39.49 | 0.999 |
| 39.5 | 0.999 |
| 39.51 | 0.999 |
| 39.52 | 0.999 |
| 39.53 | 0.999 |
| 39.54 | 0.999 |
| 39.55 | 0.999 |
| 39.56 | 0.999 |
| 39.57 | 0.999 |
| 39.58 | 0.999 |
| 39.59 | 0.999 |
| 39.6 | 0.999 |
| 39.61 | 0.999 |
| 39.62 | 0.999 |
| 39.63 | 0.999 |
| 39.64 | 0.999 |
| 39.65 | 0.999 |
| 39.66 | 0.999 |
| 39.67 | 0.999 |
| 39.68 | 0.999 |
| 39.69 | 0.999 |
| 39.7 | 0.999 |
| 39.71 | 0.999 |
| 39.72 | 0.999 |
| 39.73 | 0.999 |
| 39.74 | 0.999 |
| 39.75 | 0.999 |
| 39.76 | 0.999 |
| 39.77 | 0.999 |
| 39.78 | 0.999 |
| 39.79 | 0.999 |
| 39.8 | 0.999 |
| 39.81 | 0.999 |
| 39.82 | 0.999 |
| 39.83 | 0.999 |
| 39.84 | 0.999 |
| 39.85 | 0.999 |
| 39.86 | 0.999 |
| 39.87 | 0.999 |
| 39.88 | 0.999 |
| 39.89 | 0.999 |
| 39.9 | 0.999 |
| 39.91 | 0.999 |
| 39.92 | 0.999 |
| 39.93 | 0.999 |
| 39.94 | 0.999 |
| 39.95 | 0.999 |
| 39.96 | 0.999 |
| 39.97 | 0.999 |
| 39.98 | 0.999 |
| 39.99 | 0.999 |
| 40.0 | 0.999 |
| 40.01 | 0.999 |
| 40.02 | 0.999 |
| 40.03 | 0.999 |
| 40.04 | 0.999 |
| 40.05 | 0.999 |
| 40.06 | 0.999 |
| 40.07 | 0.999 |
| 40.08 | 0.999 |
| 40.09 | 0.999 |
| 40.1 | 0.999 |
| 40.11 | 0.999 |
| 40.12 | 0.999 |
| 40.13 | 0.999 |
| 40.14 | 0.999 |
| 40.15 | 0.999 |
| 40.16 | 0.999 |
| 40.17 | 0.999 |
| 40.18 | 0.999 |
| 40.19 | 0.999 |
| 40.2 | 0.999 |
| 40.21 | 0.999 |
| 40.22 | 0.999 |
| 40.23 | 0.999 |
| 40.24 | 0.999 |
| 40.25 | 0.999 |
| 40.26 | 0.999 |
| 40.27 | 0.999 |
| 40.28 | 0.999 |
| 40.29 | 0.999 |
| 40.3 | 0.999 |
| 40.31 | 0.999 |
| 40.32 | 0.999 |
| 40.33 | 0.999 |
| 40.34 | 0.999 |
| 40.35 | 0.999 |
| 40.36 | 0.999 |
| 40.37 | 0.999 |
| 40.38 | 0.999 |
| 40.39 | 0.999 |
| 40.4 | 0.999 |
| 40.41 | 0.999 |
| 40.42 | 0.999 |
| 40.43 | 0.999 |
| 40.44 | 0.999 |
| 40.45 | 0.999 |
| 40.46 | 0.999 |
| 40.47 | 0.999 |
| 40.48 | 0.999 |
| 40.49 | 0.999 |
| 40.5 | 0.999 |
| 40.51 | 0.999 |
| 40.52 | 0.999 |
| 40.53 | 0.999 |
| 40.54 | 0.999 |
| 40.55 | 0.999 |
| 40.56 | 0.999 |
| 40.57 | 0.999 |
| 40.58 | 0.999 |
| 40.59 | 0.999 |
| 40.6 | 0.999 |
| 40.61 | 0.999 |
| 40.62 | 0.999 |
| 40.63 | 0.999 |
| 40.64 | 0.999 |
| 40.65 | 0.999 |
| 40.66 | 0.999 |
| 40.67 | 0.999 |
| 40.68 | 0.999 |
| 40.69 | 0.999 |
| 40.7 | 0.999 |
| 40.71 | 0.999 |
| 40.72 | 0.999 |
| 40.73 | 0.999 |
| 40.74 | 0.999 |
| 40.75 | 0.999 |
| 40.76 | 0.999 |
| 40.77 | 0.999 |
| 40.78 | 0.999 |
| 40.79 | 0.999 |
| 40.8 | 0.999 |
| 40.81 | 0.999 |
| 40.82 | 0.999 |
| 40.83 | 0.999 |
| 40.84 | 0.999 |
| 40.85 | 0.999 |
| 40.86 | 0.999 |
| 40.87 | 0.999 |
| 40.88 | 0.999 |
| 40.89 | 0.999 |
| 40.9 | 0.999 |
| 40.91 | 0.999 |
| 40.92 | 0.999 |
| 40.93 | 0.999 |
| 40.94 | 0.999 |
| 40.95 | 0.999 |